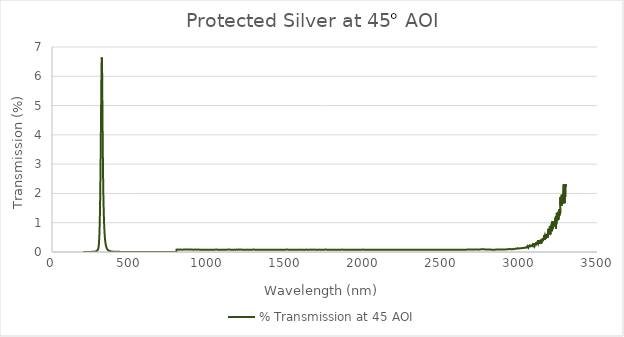
| Category | % Transmission at 45 AOI |
|---|---|
| 200.0 | 0 |
| 201.0 | 0 |
| 202.0 | 0 |
| 203.0 | 0 |
| 204.0 | 0 |
| 205.0 | 0 |
| 206.0 | 0 |
| 207.0 | 0.001 |
| 208.0 | 0 |
| 209.0 | 0 |
| 210.0 | 0.001 |
| 211.0 | 0 |
| 212.0 | 0.001 |
| 213.0 | 0.001 |
| 214.0 | 0.001 |
| 215.0 | 0.001 |
| 216.0 | 0.001 |
| 217.0 | 0.001 |
| 218.0 | 0.001 |
| 219.0 | 0.001 |
| 220.0 | 0.001 |
| 221.0 | 0.001 |
| 222.0 | 0.001 |
| 223.0 | 0.001 |
| 224.0 | 0.001 |
| 225.0 | 0.001 |
| 226.0 | 0.001 |
| 227.0 | 0.001 |
| 228.0 | 0.002 |
| 229.0 | 0.001 |
| 230.0 | 0.002 |
| 231.0 | 0.002 |
| 232.0 | 0.002 |
| 233.0 | 0.002 |
| 234.0 | 0.002 |
| 235.0 | 0.002 |
| 236.0 | 0.002 |
| 237.0 | 0.002 |
| 238.0 | 0.002 |
| 239.0 | 0.002 |
| 240.0 | 0.003 |
| 241.0 | 0.003 |
| 242.0 | 0.003 |
| 243.0 | 0.003 |
| 244.0 | 0.003 |
| 245.0 | 0.003 |
| 246.0 | 0.003 |
| 247.0 | 0.003 |
| 248.0 | 0.003 |
| 249.0 | 0.003 |
| 250.0 | 0.004 |
| 251.0 | 0.004 |
| 252.0 | 0.004 |
| 253.0 | 0.004 |
| 254.0 | 0.004 |
| 255.0 | 0.004 |
| 256.0 | 0.005 |
| 257.0 | 0.005 |
| 258.0 | 0.005 |
| 259.0 | 0.005 |
| 260.0 | 0.006 |
| 261.0 | 0.006 |
| 262.0 | 0.006 |
| 263.0 | 0.007 |
| 264.0 | 0.007 |
| 265.0 | 0.007 |
| 266.0 | 0.008 |
| 267.0 | 0.008 |
| 268.0 | 0.008 |
| 269.0 | 0.009 |
| 270.0 | 0.009 |
| 271.0 | 0.01 |
| 272.0 | 0.011 |
| 273.0 | 0.011 |
| 274.0 | 0.012 |
| 275.0 | 0.013 |
| 276.0 | 0.014 |
| 277.0 | 0.015 |
| 278.0 | 0.016 |
| 279.0 | 0.017 |
| 280.0 | 0.019 |
| 281.0 | 0.02 |
| 282.0 | 0.022 |
| 283.0 | 0.024 |
| 284.0 | 0.026 |
| 285.0 | 0.028 |
| 286.0 | 0.031 |
| 287.0 | 0.034 |
| 288.0 | 0.038 |
| 289.0 | 0.041 |
| 290.0 | 0.046 |
| 291.0 | 0.051 |
| 292.0 | 0.057 |
| 293.0 | 0.064 |
| 294.0 | 0.074 |
| 295.0 | 0.085 |
| 296.0 | 0.098 |
| 297.0 | 0.117 |
| 298.0 | 0.139 |
| 299.0 | 0.17 |
| 300.0 | 0.211 |
| 301.0 | 0.264 |
| 302.0 | 0.332 |
| 303.0 | 0.423 |
| 304.0 | 0.541 |
| 305.0 | 0.686 |
| 306.0 | 0.874 |
| 307.0 | 1.105 |
| 308.0 | 1.382 |
| 309.0 | 1.716 |
| 310.0 | 2.102 |
| 311.0 | 2.542 |
| 312.0 | 3.032 |
| 313.0 | 3.569 |
| 314.0 | 4.131 |
| 315.0 | 4.726 |
| 316.0 | 5.3 |
| 317.0 | 5.831 |
| 318.0 | 6.268 |
| 319.0 | 6.552 |
| 320.0 | 6.642 |
| 321.0 | 6.487 |
| 322.0 | 6.093 |
| 323.0 | 5.522 |
| 324.0 | 4.859 |
| 325.0 | 4.197 |
| 326.0 | 3.598 |
| 327.0 | 3.084 |
| 328.0 | 2.637 |
| 329.0 | 2.252 |
| 330.0 | 1.925 |
| 331.0 | 1.652 |
| 332.0 | 1.424 |
| 333.0 | 1.232 |
| 334.0 | 1.065 |
| 335.0 | 0.927 |
| 336.0 | 0.806 |
| 337.0 | 0.703 |
| 338.0 | 0.615 |
| 339.0 | 0.538 |
| 340.0 | 0.473 |
| 341.0 | 0.414 |
| 342.0 | 0.367 |
| 343.0 | 0.325 |
| 344.0 | 0.29 |
| 345.0 | 0.258 |
| 346.0 | 0.23 |
| 347.0 | 0.207 |
| 348.0 | 0.186 |
| 349.0 | 0.164 |
| 350.0 | 0.15 |
| 351.0 | 0.137 |
| 352.0 | 0.124 |
| 353.0 | 0.112 |
| 354.0 | 0.102 |
| 355.0 | 0.094 |
| 356.0 | 0.086 |
| 357.0 | 0.08 |
| 358.0 | 0.073 |
| 359.0 | 0.068 |
| 360.0 | 0.062 |
| 361.0 | 0.058 |
| 362.0 | 0.054 |
| 363.0 | 0.05 |
| 364.0 | 0.047 |
| 365.0 | 0.044 |
| 366.0 | 0.041 |
| 367.0 | 0.038 |
| 368.0 | 0.036 |
| 369.0 | 0.034 |
| 370.0 | 0.032 |
| 371.0 | 0.03 |
| 372.0 | 0.029 |
| 373.0 | 0.027 |
| 374.0 | 0.025 |
| 375.0 | 0.024 |
| 376.0 | 0.023 |
| 377.0 | 0.022 |
| 378.0 | 0.021 |
| 379.0 | 0.02 |
| 380.0 | 0.019 |
| 381.0 | 0.018 |
| 382.0 | 0.017 |
| 383.0 | 0.016 |
| 384.0 | 0.016 |
| 385.0 | 0.015 |
| 386.0 | 0.015 |
| 387.0 | 0.014 |
| 388.0 | 0.014 |
| 389.0 | 0.013 |
| 390.0 | 0.012 |
| 391.0 | 0.012 |
| 392.0 | 0.012 |
| 393.0 | 0.012 |
| 394.0 | 0.011 |
| 395.0 | 0.011 |
| 396.0 | 0.01 |
| 397.0 | 0.01 |
| 398.0 | 0.01 |
| 399.0 | 0.01 |
| 400.0 | 0.009 |
| 401.0 | 0.009 |
| 402.0 | 0.008 |
| 403.0 | 0.008 |
| 404.0 | 0.008 |
| 405.0 | 0.008 |
| 406.0 | 0.008 |
| 407.0 | 0.007 |
| 408.0 | 0.007 |
| 409.0 | 0.007 |
| 410.0 | 0.007 |
| 411.0 | 0.007 |
| 412.0 | 0.007 |
| 413.0 | 0.007 |
| 414.0 | 0.007 |
| 415.0 | 0.006 |
| 416.0 | 0.006 |
| 417.0 | 0.006 |
| 418.0 | 0.006 |
| 419.0 | 0.006 |
| 420.0 | 0.006 |
| 421.0 | 0.006 |
| 422.0 | 0.005 |
| 423.0 | 0.005 |
| 424.0 | 0.005 |
| 425.0 | 0.005 |
| 426.0 | 0.005 |
| 427.0 | 0.005 |
| 428.0 | 0.005 |
| 429.0 | 0.005 |
| 430.0 | 0.005 |
| 431.0 | 0.005 |
| 432.0 | 0.004 |
| 433.0 | 0.004 |
| 434.0 | 0.004 |
| 435.0 | 0.004 |
| 436.0 | 0.004 |
| 437.0 | 0.004 |
| 438.0 | 0.004 |
| 439.0 | 0.004 |
| 440.0 | 0.004 |
| 441.0 | 0.004 |
| 442.0 | 0.004 |
| 443.0 | 0.004 |
| 444.0 | 0.004 |
| 445.0 | 0.004 |
| 446.0 | 0.003 |
| 447.0 | 0.004 |
| 448.0 | 0.004 |
| 449.0 | 0.003 |
| 450.0 | 0.003 |
| 451.0 | 0.004 |
| 452.0 | 0.003 |
| 453.0 | 0.003 |
| 454.0 | 0.003 |
| 455.0 | 0.003 |
| 456.0 | 0.003 |
| 457.0 | 0.003 |
| 458.0 | 0.003 |
| 459.0 | 0.003 |
| 460.0 | 0.003 |
| 461.0 | 0.003 |
| 462.0 | 0.003 |
| 463.0 | 0.003 |
| 464.0 | 0.003 |
| 465.0 | 0.003 |
| 466.0 | 0.003 |
| 467.0 | 0.003 |
| 468.0 | 0.003 |
| 469.0 | 0.003 |
| 470.0 | 0.003 |
| 471.0 | 0.003 |
| 472.0 | 0.003 |
| 473.0 | 0.003 |
| 474.0 | 0.002 |
| 475.0 | 0.003 |
| 476.0 | 0.003 |
| 477.0 | 0.003 |
| 478.0 | 0.002 |
| 479.0 | 0.002 |
| 480.0 | 0.002 |
| 481.0 | 0.002 |
| 482.0 | 0.002 |
| 483.0 | 0.002 |
| 484.0 | 0.002 |
| 485.0 | 0.002 |
| 486.0 | 0.002 |
| 487.0 | 0.002 |
| 488.0 | 0.002 |
| 489.0 | 0.002 |
| 490.0 | 0.002 |
| 491.0 | 0.002 |
| 492.0 | 0.002 |
| 493.0 | 0.002 |
| 494.0 | 0.002 |
| 495.0 | 0.002 |
| 496.0 | 0.002 |
| 497.0 | 0.002 |
| 498.0 | 0.002 |
| 499.0 | 0.002 |
| 500.0 | 0.002 |
| 501.0 | 0.002 |
| 502.0 | 0.002 |
| 503.0 | 0.002 |
| 504.0 | 0.002 |
| 505.0 | 0.002 |
| 506.0 | 0.002 |
| 507.0 | 0.002 |
| 508.0 | 0.002 |
| 509.0 | 0.002 |
| 510.0 | 0.002 |
| 511.0 | 0.002 |
| 512.0 | 0.002 |
| 513.0 | 0.002 |
| 514.0 | 0.002 |
| 515.0 | 0.002 |
| 516.0 | 0.002 |
| 517.0 | 0.002 |
| 518.0 | 0.002 |
| 519.0 | 0.002 |
| 520.0 | 0.002 |
| 521.0 | 0.002 |
| 522.0 | 0.002 |
| 523.0 | 0.002 |
| 524.0 | 0.002 |
| 525.0 | 0.002 |
| 526.0 | 0.002 |
| 527.0 | 0.002 |
| 528.0 | 0.002 |
| 529.0 | 0.002 |
| 530.0 | 0.002 |
| 531.0 | 0.002 |
| 532.0 | 0.002 |
| 533.0 | 0.002 |
| 534.0 | 0.002 |
| 535.0 | 0.002 |
| 536.0 | 0.002 |
| 537.0 | 0.002 |
| 538.0 | 0.002 |
| 539.0 | 0.002 |
| 540.0 | 0.002 |
| 541.0 | 0.001 |
| 542.0 | 0.002 |
| 543.0 | 0.002 |
| 544.0 | 0.001 |
| 545.0 | 0.002 |
| 546.0 | 0.002 |
| 547.0 | 0.002 |
| 548.0 | 0.002 |
| 549.0 | 0.002 |
| 550.0 | 0.001 |
| 551.0 | 0.001 |
| 552.0 | 0.002 |
| 553.0 | 0.002 |
| 554.0 | 0.001 |
| 555.0 | 0.001 |
| 556.0 | 0.002 |
| 557.0 | 0.002 |
| 558.0 | 0.001 |
| 559.0 | 0.001 |
| 560.0 | 0.001 |
| 561.0 | 0.002 |
| 562.0 | 0.001 |
| 563.0 | 0.001 |
| 564.0 | 0.001 |
| 565.0 | 0.001 |
| 566.0 | 0.001 |
| 567.0 | 0.001 |
| 568.0 | 0.001 |
| 569.0 | 0.001 |
| 570.0 | 0.002 |
| 571.0 | 0.001 |
| 572.0 | 0.001 |
| 573.0 | 0.001 |
| 574.0 | 0.001 |
| 575.0 | 0.001 |
| 576.0 | 0.001 |
| 577.0 | 0.001 |
| 578.0 | 0.001 |
| 579.0 | 0.001 |
| 580.0 | 0.001 |
| 581.0 | 0.001 |
| 582.0 | 0.001 |
| 583.0 | 0.001 |
| 584.0 | 0.001 |
| 585.0 | 0.001 |
| 586.0 | 0.001 |
| 587.0 | 0.001 |
| 588.0 | 0.001 |
| 589.0 | 0.001 |
| 590.0 | 0.001 |
| 591.0 | 0.001 |
| 592.0 | 0.001 |
| 593.0 | 0.001 |
| 594.0 | 0.001 |
| 595.0 | 0.001 |
| 596.0 | 0.001 |
| 597.0 | 0.001 |
| 598.0 | 0.001 |
| 599.0 | 0.001 |
| 600.0 | 0.001 |
| 601.0 | 0.001 |
| 602.0 | 0.001 |
| 603.0 | 0.001 |
| 604.0 | 0.001 |
| 605.0 | 0.001 |
| 606.0 | 0.001 |
| 607.0 | 0.001 |
| 608.0 | 0.001 |
| 609.0 | 0.001 |
| 610.0 | 0.001 |
| 611.0 | 0.001 |
| 612.0 | 0.001 |
| 613.0 | 0.001 |
| 614.0 | 0.001 |
| 615.0 | 0.001 |
| 616.0 | 0.001 |
| 617.0 | 0.001 |
| 618.0 | 0.001 |
| 619.0 | 0.001 |
| 620.0 | 0.001 |
| 621.0 | 0.001 |
| 622.0 | 0.001 |
| 623.0 | 0.001 |
| 624.0 | 0.001 |
| 625.0 | 0.001 |
| 626.0 | 0.001 |
| 627.0 | 0.001 |
| 628.0 | 0.001 |
| 629.0 | 0.001 |
| 630.0 | 0.001 |
| 631.0 | 0.001 |
| 632.0 | 0.001 |
| 633.0 | 0.001 |
| 634.0 | 0.001 |
| 635.0 | 0.001 |
| 636.0 | 0.001 |
| 637.0 | 0.001 |
| 638.0 | 0.001 |
| 639.0 | 0.001 |
| 640.0 | 0.001 |
| 641.0 | 0.001 |
| 642.0 | 0.001 |
| 643.0 | 0.001 |
| 644.0 | 0.001 |
| 645.0 | 0.001 |
| 646.0 | 0.001 |
| 647.0 | 0.001 |
| 648.0 | 0.001 |
| 649.0 | 0.001 |
| 650.0 | 0.001 |
| 651.0 | 0.001 |
| 652.0 | 0.001 |
| 653.0 | 0.001 |
| 654.0 | 0.001 |
| 655.0 | 0.001 |
| 656.0 | 0.001 |
| 657.0 | 0.001 |
| 658.0 | 0.001 |
| 659.0 | 0.001 |
| 660.0 | 0.001 |
| 661.0 | 0.001 |
| 662.0 | 0.001 |
| 663.0 | 0.001 |
| 664.0 | 0.001 |
| 665.0 | 0.001 |
| 666.0 | 0.001 |
| 667.0 | 0.001 |
| 668.0 | 0.001 |
| 669.0 | 0.001 |
| 670.0 | 0.001 |
| 671.0 | 0.001 |
| 672.0 | 0.001 |
| 673.0 | 0.001 |
| 674.0 | 0.001 |
| 675.0 | 0.001 |
| 676.0 | 0.001 |
| 677.0 | 0.001 |
| 678.0 | 0.001 |
| 679.0 | 0.001 |
| 680.0 | 0.001 |
| 681.0 | 0.001 |
| 682.0 | 0.001 |
| 683.0 | 0.001 |
| 684.0 | 0.001 |
| 685.0 | 0.001 |
| 686.0 | 0.001 |
| 687.0 | 0.001 |
| 688.0 | 0.001 |
| 689.0 | 0.001 |
| 690.0 | 0.001 |
| 691.0 | 0.001 |
| 692.0 | 0.001 |
| 693.0 | 0.001 |
| 694.0 | 0.001 |
| 695.0 | 0.001 |
| 696.0 | 0.001 |
| 697.0 | 0.001 |
| 698.0 | 0.001 |
| 699.0 | 0.001 |
| 700.0 | 0.001 |
| 701.0 | 0.001 |
| 702.0 | 0.001 |
| 703.0 | 0.001 |
| 704.0 | 0.001 |
| 705.0 | 0.001 |
| 706.0 | 0.001 |
| 707.0 | 0.001 |
| 708.0 | 0.001 |
| 709.0 | 0.001 |
| 710.0 | 0.001 |
| 711.0 | 0.001 |
| 712.0 | 0.001 |
| 713.0 | 0.001 |
| 714.0 | 0.001 |
| 715.0 | 0.001 |
| 716.0 | 0.001 |
| 717.0 | 0.001 |
| 718.0 | 0.001 |
| 719.0 | 0.001 |
| 720.0 | 0.001 |
| 721.0 | 0.001 |
| 722.0 | 0.001 |
| 723.0 | 0.001 |
| 724.0 | 0.001 |
| 725.0 | 0.001 |
| 726.0 | 0.001 |
| 727.0 | 0.001 |
| 728.0 | 0.001 |
| 729.0 | 0.001 |
| 730.0 | 0.001 |
| 731.0 | 0.001 |
| 732.0 | 0.001 |
| 733.0 | 0.001 |
| 734.0 | 0.001 |
| 735.0 | 0.001 |
| 736.0 | 0.001 |
| 737.0 | 0.001 |
| 738.0 | 0.001 |
| 739.0 | 0.001 |
| 740.0 | 0.001 |
| 741.0 | 0.001 |
| 742.0 | 0.001 |
| 743.0 | 0.001 |
| 744.0 | 0.001 |
| 745.0 | 0.001 |
| 746.0 | 0.001 |
| 747.0 | 0.001 |
| 748.0 | 0.001 |
| 749.0 | 0.001 |
| 750.0 | 0.001 |
| 751.0 | 0.001 |
| 752.0 | 0.001 |
| 753.0 | 0.001 |
| 754.0 | 0.001 |
| 755.0 | 0.001 |
| 756.0 | 0.001 |
| 757.0 | 0.001 |
| 758.0 | 0.001 |
| 759.0 | 0.001 |
| 760.0 | 0.001 |
| 761.0 | 0.001 |
| 762.0 | 0.001 |
| 763.0 | 0.001 |
| 764.0 | 0.001 |
| 765.0 | 0.001 |
| 766.0 | 0.001 |
| 767.0 | 0.001 |
| 768.0 | 0.001 |
| 769.0 | 0.001 |
| 770.0 | 0.001 |
| 771.0 | 0.001 |
| 772.0 | 0.001 |
| 773.0 | 0.001 |
| 774.0 | 0.001 |
| 775.0 | 0.001 |
| 776.0 | 0.001 |
| 777.0 | 0.001 |
| 778.0 | 0.001 |
| 779.0 | 0.001 |
| 780.0 | 0.001 |
| 781.0 | 0.001 |
| 782.0 | 0.001 |
| 783.0 | 0.001 |
| 784.0 | 0.001 |
| 785.0 | 0.001 |
| 786.0 | 0.001 |
| 787.0 | 0.001 |
| 788.0 | 0.001 |
| 789.0 | 0.001 |
| 790.0 | 0.001 |
| 791.0 | 0.001 |
| 792.0 | 0.001 |
| 793.0 | 0.001 |
| 794.0 | 0.001 |
| 795.0 | 0.001 |
| 796.0 | 0.001 |
| 797.0 | 0.001 |
| 798.0 | 0.001 |
| 799.0 | 0 |
| 800.0 | 0.081 |
| 801.0 | 0.084 |
| 802.0 | 0.083 |
| 803.0 | 0.081 |
| 804.0 | 0.081 |
| 805.0 | 0.086 |
| 806.0 | 0.082 |
| 807.0 | 0.085 |
| 808.0 | 0.081 |
| 809.0 | 0.084 |
| 810.0 | 0.083 |
| 811.0 | 0.083 |
| 812.0 | 0.082 |
| 813.0 | 0.084 |
| 814.0 | 0.08 |
| 815.0 | 0.084 |
| 816.0 | 0.082 |
| 817.0 | 0.081 |
| 818.0 | 0.084 |
| 819.0 | 0.082 |
| 820.0 | 0.082 |
| 821.0 | 0.082 |
| 822.0 | 0.084 |
| 823.0 | 0.082 |
| 824.0 | 0.082 |
| 825.0 | 0.084 |
| 826.0 | 0.083 |
| 827.0 | 0.083 |
| 828.0 | 0.081 |
| 829.0 | 0.085 |
| 830.0 | 0.083 |
| 831.0 | 0.082 |
| 832.0 | 0.084 |
| 833.0 | 0.083 |
| 834.0 | 0.084 |
| 835.0 | 0.08 |
| 836.0 | 0.079 |
| 837.0 | 0.083 |
| 838.0 | 0.08 |
| 839.0 | 0.085 |
| 840.0 | 0.084 |
| 841.0 | 0.082 |
| 842.0 | 0.081 |
| 843.0 | 0.085 |
| 844.0 | 0.086 |
| 845.0 | 0.082 |
| 846.0 | 0.084 |
| 847.0 | 0.085 |
| 848.0 | 0.084 |
| 849.0 | 0.086 |
| 850.0 | 0.08 |
| 851.0 | 0.082 |
| 852.0 | 0.083 |
| 853.0 | 0.084 |
| 854.0 | 0.085 |
| 855.0 | 0.08 |
| 856.0 | 0.083 |
| 857.0 | 0.083 |
| 858.0 | 0.083 |
| 859.0 | 0.086 |
| 860.0 | 0.086 |
| 861.0 | 0.084 |
| 862.0 | 0.083 |
| 863.0 | 0.085 |
| 864.0 | 0.082 |
| 865.0 | 0.082 |
| 866.0 | 0.082 |
| 867.0 | 0.085 |
| 868.0 | 0.082 |
| 869.0 | 0.081 |
| 870.0 | 0.082 |
| 871.0 | 0.082 |
| 872.0 | 0.081 |
| 873.0 | 0.085 |
| 874.0 | 0.083 |
| 875.0 | 0.082 |
| 876.0 | 0.083 |
| 877.0 | 0.082 |
| 878.0 | 0.082 |
| 879.0 | 0.082 |
| 880.0 | 0.083 |
| 881.0 | 0.082 |
| 882.0 | 0.083 |
| 883.0 | 0.082 |
| 884.0 | 0.08 |
| 885.0 | 0.086 |
| 886.0 | 0.082 |
| 887.0 | 0.082 |
| 888.0 | 0.082 |
| 889.0 | 0.081 |
| 890.0 | 0.08 |
| 891.0 | 0.083 |
| 892.0 | 0.085 |
| 893.0 | 0.082 |
| 894.0 | 0.084 |
| 895.0 | 0.082 |
| 896.0 | 0.083 |
| 897.0 | 0.082 |
| 898.0 | 0.083 |
| 899.0 | 0.081 |
| 900.0 | 0.083 |
| 901.0 | 0.083 |
| 902.0 | 0.081 |
| 903.0 | 0.081 |
| 904.0 | 0.081 |
| 905.0 | 0.081 |
| 906.0 | 0.081 |
| 907.0 | 0.083 |
| 908.0 | 0.081 |
| 909.0 | 0.082 |
| 910.0 | 0.083 |
| 911.0 | 0.08 |
| 912.0 | 0.08 |
| 913.0 | 0.083 |
| 914.0 | 0.081 |
| 915.0 | 0.081 |
| 916.0 | 0.081 |
| 917.0 | 0.08 |
| 918.0 | 0.083 |
| 919.0 | 0.082 |
| 920.0 | 0.08 |
| 921.0 | 0.08 |
| 922.0 | 0.084 |
| 923.0 | 0.081 |
| 924.0 | 0.082 |
| 925.0 | 0.082 |
| 926.0 | 0.081 |
| 927.0 | 0.079 |
| 928.0 | 0.078 |
| 929.0 | 0.08 |
| 930.0 | 0.081 |
| 931.0 | 0.081 |
| 932.0 | 0.082 |
| 933.0 | 0.08 |
| 934.0 | 0.08 |
| 935.0 | 0.081 |
| 936.0 | 0.08 |
| 937.0 | 0.082 |
| 938.0 | 0.081 |
| 939.0 | 0.081 |
| 940.0 | 0.084 |
| 941.0 | 0.08 |
| 942.0 | 0.08 |
| 943.0 | 0.078 |
| 944.0 | 0.08 |
| 945.0 | 0.081 |
| 946.0 | 0.081 |
| 947.0 | 0.081 |
| 948.0 | 0.079 |
| 949.0 | 0.08 |
| 950.0 | 0.082 |
| 951.0 | 0.08 |
| 952.0 | 0.083 |
| 953.0 | 0.081 |
| 954.0 | 0.081 |
| 955.0 | 0.083 |
| 956.0 | 0.08 |
| 957.0 | 0.081 |
| 958.0 | 0.082 |
| 959.0 | 0.082 |
| 960.0 | 0.08 |
| 961.0 | 0.081 |
| 962.0 | 0.079 |
| 963.0 | 0.082 |
| 964.0 | 0.081 |
| 965.0 | 0.08 |
| 966.0 | 0.079 |
| 967.0 | 0.08 |
| 968.0 | 0.08 |
| 969.0 | 0.082 |
| 970.0 | 0.081 |
| 971.0 | 0.083 |
| 972.0 | 0.081 |
| 973.0 | 0.08 |
| 974.0 | 0.08 |
| 975.0 | 0.08 |
| 976.0 | 0.083 |
| 977.0 | 0.084 |
| 978.0 | 0.081 |
| 979.0 | 0.079 |
| 980.0 | 0.078 |
| 981.0 | 0.081 |
| 982.0 | 0.081 |
| 983.0 | 0.079 |
| 984.0 | 0.083 |
| 985.0 | 0.081 |
| 986.0 | 0.081 |
| 987.0 | 0.079 |
| 988.0 | 0.081 |
| 989.0 | 0.079 |
| 990.0 | 0.083 |
| 991.0 | 0.08 |
| 992.0 | 0.081 |
| 993.0 | 0.081 |
| 994.0 | 0.083 |
| 995.0 | 0.08 |
| 996.0 | 0.081 |
| 997.0 | 0.081 |
| 998.0 | 0.08 |
| 999.0 | 0.082 |
| 1000.0 | 0.081 |
| 1001.0 | 0.081 |
| 1002.0 | 0.082 |
| 1003.0 | 0.079 |
| 1004.0 | 0.077 |
| 1005.0 | 0.08 |
| 1006.0 | 0.083 |
| 1007.0 | 0.079 |
| 1008.0 | 0.08 |
| 1009.0 | 0.078 |
| 1010.0 | 0.08 |
| 1011.0 | 0.08 |
| 1012.0 | 0.078 |
| 1013.0 | 0.079 |
| 1014.0 | 0.08 |
| 1015.0 | 0.081 |
| 1016.0 | 0.081 |
| 1017.0 | 0.081 |
| 1018.0 | 0.082 |
| 1019.0 | 0.078 |
| 1020.0 | 0.081 |
| 1021.0 | 0.081 |
| 1022.0 | 0.08 |
| 1023.0 | 0.082 |
| 1024.0 | 0.08 |
| 1025.0 | 0.081 |
| 1026.0 | 0.078 |
| 1027.0 | 0.079 |
| 1028.0 | 0.081 |
| 1029.0 | 0.082 |
| 1030.0 | 0.082 |
| 1031.0 | 0.08 |
| 1032.0 | 0.081 |
| 1033.0 | 0.081 |
| 1034.0 | 0.081 |
| 1035.0 | 0.081 |
| 1036.0 | 0.084 |
| 1037.0 | 0.081 |
| 1038.0 | 0.08 |
| 1039.0 | 0.079 |
| 1040.0 | 0.08 |
| 1041.0 | 0.081 |
| 1042.0 | 0.08 |
| 1043.0 | 0.082 |
| 1044.0 | 0.082 |
| 1045.0 | 0.079 |
| 1046.0 | 0.081 |
| 1047.0 | 0.081 |
| 1048.0 | 0.082 |
| 1049.0 | 0.082 |
| 1050.0 | 0.081 |
| 1051.0 | 0.081 |
| 1052.0 | 0.083 |
| 1053.0 | 0.079 |
| 1054.0 | 0.081 |
| 1055.0 | 0.081 |
| 1056.0 | 0.081 |
| 1057.0 | 0.079 |
| 1058.0 | 0.08 |
| 1059.0 | 0.081 |
| 1060.0 | 0.08 |
| 1061.0 | 0.08 |
| 1062.0 | 0.081 |
| 1063.0 | 0.082 |
| 1064.0 | 0.083 |
| 1065.0 | 0.081 |
| 1066.0 | 0.078 |
| 1067.0 | 0.08 |
| 1068.0 | 0.081 |
| 1069.0 | 0.082 |
| 1070.0 | 0.08 |
| 1071.0 | 0.082 |
| 1072.0 | 0.08 |
| 1073.0 | 0.079 |
| 1074.0 | 0.081 |
| 1075.0 | 0.08 |
| 1076.0 | 0.082 |
| 1077.0 | 0.082 |
| 1078.0 | 0.078 |
| 1079.0 | 0.078 |
| 1080.0 | 0.081 |
| 1081.0 | 0.081 |
| 1082.0 | 0.08 |
| 1083.0 | 0.081 |
| 1084.0 | 0.08 |
| 1085.0 | 0.078 |
| 1086.0 | 0.081 |
| 1087.0 | 0.081 |
| 1088.0 | 0.079 |
| 1089.0 | 0.08 |
| 1090.0 | 0.08 |
| 1091.0 | 0.082 |
| 1092.0 | 0.078 |
| 1093.0 | 0.08 |
| 1094.0 | 0.078 |
| 1095.0 | 0.079 |
| 1096.0 | 0.078 |
| 1097.0 | 0.08 |
| 1098.0 | 0.083 |
| 1099.0 | 0.081 |
| 1100.0 | 0.077 |
| 1101.0 | 0.078 |
| 1102.0 | 0.079 |
| 1103.0 | 0.079 |
| 1104.0 | 0.078 |
| 1105.0 | 0.08 |
| 1106.0 | 0.078 |
| 1107.0 | 0.082 |
| 1108.0 | 0.08 |
| 1109.0 | 0.079 |
| 1110.0 | 0.079 |
| 1111.0 | 0.082 |
| 1112.0 | 0.08 |
| 1113.0 | 0.079 |
| 1114.0 | 0.083 |
| 1115.0 | 0.08 |
| 1116.0 | 0.078 |
| 1117.0 | 0.08 |
| 1118.0 | 0.081 |
| 1119.0 | 0.08 |
| 1120.0 | 0.082 |
| 1121.0 | 0.082 |
| 1122.0 | 0.077 |
| 1123.0 | 0.08 |
| 1124.0 | 0.081 |
| 1125.0 | 0.079 |
| 1126.0 | 0.081 |
| 1127.0 | 0.08 |
| 1128.0 | 0.079 |
| 1129.0 | 0.085 |
| 1130.0 | 0.08 |
| 1131.0 | 0.08 |
| 1132.0 | 0.083 |
| 1133.0 | 0.082 |
| 1134.0 | 0.079 |
| 1135.0 | 0.078 |
| 1136.0 | 0.083 |
| 1137.0 | 0.078 |
| 1138.0 | 0.081 |
| 1139.0 | 0.079 |
| 1140.0 | 0.08 |
| 1141.0 | 0.077 |
| 1142.0 | 0.08 |
| 1143.0 | 0.081 |
| 1144.0 | 0.081 |
| 1145.0 | 0.081 |
| 1146.0 | 0.078 |
| 1147.0 | 0.077 |
| 1148.0 | 0.08 |
| 1149.0 | 0.081 |
| 1150.0 | 0.079 |
| 1151.0 | 0.081 |
| 1152.0 | 0.08 |
| 1153.0 | 0.079 |
| 1154.0 | 0.079 |
| 1155.0 | 0.079 |
| 1156.0 | 0.083 |
| 1157.0 | 0.08 |
| 1158.0 | 0.079 |
| 1159.0 | 0.079 |
| 1160.0 | 0.078 |
| 1161.0 | 0.081 |
| 1162.0 | 0.08 |
| 1163.0 | 0.08 |
| 1164.0 | 0.08 |
| 1165.0 | 0.081 |
| 1166.0 | 0.08 |
| 1167.0 | 0.081 |
| 1168.0 | 0.078 |
| 1169.0 | 0.081 |
| 1170.0 | 0.078 |
| 1171.0 | 0.08 |
| 1172.0 | 0.079 |
| 1173.0 | 0.081 |
| 1174.0 | 0.08 |
| 1175.0 | 0.077 |
| 1176.0 | 0.08 |
| 1177.0 | 0.08 |
| 1178.0 | 0.08 |
| 1179.0 | 0.08 |
| 1180.0 | 0.079 |
| 1181.0 | 0.082 |
| 1182.0 | 0.083 |
| 1183.0 | 0.081 |
| 1184.0 | 0.078 |
| 1185.0 | 0.082 |
| 1186.0 | 0.08 |
| 1187.0 | 0.08 |
| 1188.0 | 0.081 |
| 1189.0 | 0.079 |
| 1190.0 | 0.08 |
| 1191.0 | 0.08 |
| 1192.0 | 0.078 |
| 1193.0 | 0.082 |
| 1194.0 | 0.082 |
| 1195.0 | 0.08 |
| 1196.0 | 0.08 |
| 1197.0 | 0.08 |
| 1198.0 | 0.084 |
| 1199.0 | 0.085 |
| 1200.0 | 0.081 |
| 1201.0 | 0.079 |
| 1202.0 | 0.08 |
| 1203.0 | 0.081 |
| 1204.0 | 0.081 |
| 1205.0 | 0.08 |
| 1206.0 | 0.081 |
| 1207.0 | 0.081 |
| 1208.0 | 0.08 |
| 1209.0 | 0.08 |
| 1210.0 | 0.082 |
| 1211.0 | 0.076 |
| 1212.0 | 0.081 |
| 1213.0 | 0.081 |
| 1214.0 | 0.082 |
| 1215.0 | 0.08 |
| 1216.0 | 0.078 |
| 1217.0 | 0.079 |
| 1218.0 | 0.081 |
| 1219.0 | 0.079 |
| 1220.0 | 0.081 |
| 1221.0 | 0.08 |
| 1222.0 | 0.077 |
| 1223.0 | 0.08 |
| 1224.0 | 0.08 |
| 1225.0 | 0.079 |
| 1226.0 | 0.08 |
| 1227.0 | 0.08 |
| 1228.0 | 0.081 |
| 1229.0 | 0.081 |
| 1230.0 | 0.079 |
| 1231.0 | 0.081 |
| 1232.0 | 0.077 |
| 1233.0 | 0.079 |
| 1234.0 | 0.081 |
| 1235.0 | 0.08 |
| 1236.0 | 0.079 |
| 1237.0 | 0.08 |
| 1238.0 | 0.079 |
| 1239.0 | 0.077 |
| 1240.0 | 0.081 |
| 1241.0 | 0.08 |
| 1242.0 | 0.077 |
| 1243.0 | 0.082 |
| 1244.0 | 0.079 |
| 1245.0 | 0.082 |
| 1246.0 | 0.08 |
| 1247.0 | 0.081 |
| 1248.0 | 0.081 |
| 1249.0 | 0.078 |
| 1250.0 | 0.08 |
| 1251.0 | 0.08 |
| 1252.0 | 0.08 |
| 1253.0 | 0.082 |
| 1254.0 | 0.078 |
| 1255.0 | 0.079 |
| 1256.0 | 0.081 |
| 1257.0 | 0.079 |
| 1258.0 | 0.08 |
| 1259.0 | 0.079 |
| 1260.0 | 0.081 |
| 1261.0 | 0.079 |
| 1262.0 | 0.078 |
| 1263.0 | 0.079 |
| 1264.0 | 0.08 |
| 1265.0 | 0.081 |
| 1266.0 | 0.08 |
| 1267.0 | 0.081 |
| 1268.0 | 0.079 |
| 1269.0 | 0.08 |
| 1270.0 | 0.08 |
| 1271.0 | 0.08 |
| 1272.0 | 0.081 |
| 1273.0 | 0.081 |
| 1274.0 | 0.08 |
| 1275.0 | 0.08 |
| 1276.0 | 0.08 |
| 1277.0 | 0.078 |
| 1278.0 | 0.081 |
| 1279.0 | 0.079 |
| 1280.0 | 0.081 |
| 1281.0 | 0.081 |
| 1282.0 | 0.08 |
| 1283.0 | 0.079 |
| 1284.0 | 0.082 |
| 1285.0 | 0.081 |
| 1286.0 | 0.079 |
| 1287.0 | 0.08 |
| 1288.0 | 0.079 |
| 1289.0 | 0.081 |
| 1290.0 | 0.081 |
| 1291.0 | 0.078 |
| 1292.0 | 0.08 |
| 1293.0 | 0.078 |
| 1294.0 | 0.08 |
| 1295.0 | 0.084 |
| 1296.0 | 0.08 |
| 1297.0 | 0.082 |
| 1298.0 | 0.081 |
| 1299.0 | 0.082 |
| 1300.0 | 0.078 |
| 1301.0 | 0.081 |
| 1302.0 | 0.079 |
| 1303.0 | 0.078 |
| 1304.0 | 0.081 |
| 1305.0 | 0.081 |
| 1306.0 | 0.078 |
| 1307.0 | 0.078 |
| 1308.0 | 0.081 |
| 1309.0 | 0.08 |
| 1310.0 | 0.079 |
| 1311.0 | 0.08 |
| 1312.0 | 0.082 |
| 1313.0 | 0.079 |
| 1314.0 | 0.08 |
| 1315.0 | 0.08 |
| 1316.0 | 0.079 |
| 1317.0 | 0.08 |
| 1318.0 | 0.081 |
| 1319.0 | 0.078 |
| 1320.0 | 0.08 |
| 1321.0 | 0.079 |
| 1322.0 | 0.081 |
| 1323.0 | 0.081 |
| 1324.0 | 0.08 |
| 1325.0 | 0.081 |
| 1326.0 | 0.082 |
| 1327.0 | 0.082 |
| 1328.0 | 0.079 |
| 1329.0 | 0.079 |
| 1330.0 | 0.08 |
| 1331.0 | 0.08 |
| 1332.0 | 0.081 |
| 1333.0 | 0.081 |
| 1334.0 | 0.079 |
| 1335.0 | 0.082 |
| 1336.0 | 0.081 |
| 1337.0 | 0.081 |
| 1338.0 | 0.082 |
| 1339.0 | 0.076 |
| 1340.0 | 0.08 |
| 1341.0 | 0.08 |
| 1342.0 | 0.082 |
| 1343.0 | 0.077 |
| 1344.0 | 0.082 |
| 1345.0 | 0.08 |
| 1346.0 | 0.08 |
| 1347.0 | 0.081 |
| 1348.0 | 0.081 |
| 1349.0 | 0.081 |
| 1350.0 | 0.081 |
| 1351.0 | 0.082 |
| 1352.0 | 0.079 |
| 1353.0 | 0.08 |
| 1354.0 | 0.08 |
| 1355.0 | 0.08 |
| 1356.0 | 0.08 |
| 1357.0 | 0.079 |
| 1358.0 | 0.082 |
| 1359.0 | 0.078 |
| 1360.0 | 0.079 |
| 1361.0 | 0.08 |
| 1362.0 | 0.079 |
| 1363.0 | 0.078 |
| 1364.0 | 0.078 |
| 1365.0 | 0.077 |
| 1366.0 | 0.08 |
| 1367.0 | 0.079 |
| 1368.0 | 0.079 |
| 1369.0 | 0.08 |
| 1370.0 | 0.081 |
| 1371.0 | 0.081 |
| 1372.0 | 0.082 |
| 1373.0 | 0.08 |
| 1374.0 | 0.081 |
| 1375.0 | 0.081 |
| 1376.0 | 0.08 |
| 1377.0 | 0.08 |
| 1378.0 | 0.079 |
| 1379.0 | 0.078 |
| 1380.0 | 0.078 |
| 1381.0 | 0.08 |
| 1382.0 | 0.082 |
| 1383.0 | 0.08 |
| 1384.0 | 0.08 |
| 1385.0 | 0.082 |
| 1386.0 | 0.08 |
| 1387.0 | 0.08 |
| 1388.0 | 0.081 |
| 1389.0 | 0.081 |
| 1390.0 | 0.082 |
| 1391.0 | 0.081 |
| 1392.0 | 0.08 |
| 1393.0 | 0.08 |
| 1394.0 | 0.079 |
| 1395.0 | 0.078 |
| 1396.0 | 0.082 |
| 1397.0 | 0.082 |
| 1398.0 | 0.078 |
| 1399.0 | 0.078 |
| 1400.0 | 0.08 |
| 1401.0 | 0.081 |
| 1402.0 | 0.079 |
| 1403.0 | 0.08 |
| 1404.0 | 0.078 |
| 1405.0 | 0.079 |
| 1406.0 | 0.08 |
| 1407.0 | 0.08 |
| 1408.0 | 0.08 |
| 1409.0 | 0.08 |
| 1410.0 | 0.081 |
| 1411.0 | 0.078 |
| 1412.0 | 0.078 |
| 1413.0 | 0.079 |
| 1414.0 | 0.081 |
| 1415.0 | 0.078 |
| 1416.0 | 0.077 |
| 1417.0 | 0.079 |
| 1418.0 | 0.079 |
| 1419.0 | 0.08 |
| 1420.0 | 0.08 |
| 1421.0 | 0.08 |
| 1422.0 | 0.081 |
| 1423.0 | 0.078 |
| 1424.0 | 0.081 |
| 1425.0 | 0.078 |
| 1426.0 | 0.082 |
| 1427.0 | 0.079 |
| 1428.0 | 0.076 |
| 1429.0 | 0.082 |
| 1430.0 | 0.077 |
| 1431.0 | 0.078 |
| 1432.0 | 0.083 |
| 1433.0 | 0.079 |
| 1434.0 | 0.08 |
| 1435.0 | 0.08 |
| 1436.0 | 0.081 |
| 1437.0 | 0.08 |
| 1438.0 | 0.08 |
| 1439.0 | 0.079 |
| 1440.0 | 0.081 |
| 1441.0 | 0.079 |
| 1442.0 | 0.08 |
| 1443.0 | 0.078 |
| 1444.0 | 0.079 |
| 1445.0 | 0.08 |
| 1446.0 | 0.079 |
| 1447.0 | 0.082 |
| 1448.0 | 0.08 |
| 1449.0 | 0.079 |
| 1450.0 | 0.078 |
| 1451.0 | 0.081 |
| 1452.0 | 0.08 |
| 1453.0 | 0.08 |
| 1454.0 | 0.081 |
| 1455.0 | 0.08 |
| 1456.0 | 0.077 |
| 1457.0 | 0.079 |
| 1458.0 | 0.078 |
| 1459.0 | 0.079 |
| 1460.0 | 0.08 |
| 1461.0 | 0.079 |
| 1462.0 | 0.081 |
| 1463.0 | 0.079 |
| 1464.0 | 0.079 |
| 1465.0 | 0.08 |
| 1466.0 | 0.081 |
| 1467.0 | 0.079 |
| 1468.0 | 0.08 |
| 1469.0 | 0.078 |
| 1470.0 | 0.08 |
| 1471.0 | 0.078 |
| 1472.0 | 0.081 |
| 1473.0 | 0.078 |
| 1474.0 | 0.08 |
| 1475.0 | 0.079 |
| 1476.0 | 0.078 |
| 1477.0 | 0.08 |
| 1478.0 | 0.078 |
| 1479.0 | 0.078 |
| 1480.0 | 0.082 |
| 1481.0 | 0.076 |
| 1482.0 | 0.08 |
| 1483.0 | 0.079 |
| 1484.0 | 0.078 |
| 1485.0 | 0.08 |
| 1486.0 | 0.079 |
| 1487.0 | 0.078 |
| 1488.0 | 0.079 |
| 1489.0 | 0.078 |
| 1490.0 | 0.083 |
| 1491.0 | 0.082 |
| 1492.0 | 0.081 |
| 1493.0 | 0.079 |
| 1494.0 | 0.078 |
| 1495.0 | 0.079 |
| 1496.0 | 0.079 |
| 1497.0 | 0.079 |
| 1498.0 | 0.081 |
| 1499.0 | 0.079 |
| 1500.0 | 0.081 |
| 1501.0 | 0.078 |
| 1502.0 | 0.079 |
| 1503.0 | 0.081 |
| 1504.0 | 0.079 |
| 1505.0 | 0.078 |
| 1506.0 | 0.08 |
| 1507.0 | 0.082 |
| 1508.0 | 0.079 |
| 1509.0 | 0.081 |
| 1510.0 | 0.08 |
| 1511.0 | 0.079 |
| 1512.0 | 0.077 |
| 1513.0 | 0.078 |
| 1514.0 | 0.081 |
| 1515.0 | 0.079 |
| 1516.0 | 0.081 |
| 1517.0 | 0.078 |
| 1518.0 | 0.082 |
| 1519.0 | 0.08 |
| 1520.0 | 0.077 |
| 1521.0 | 0.078 |
| 1522.0 | 0.079 |
| 1523.0 | 0.077 |
| 1524.0 | 0.081 |
| 1525.0 | 0.08 |
| 1526.0 | 0.08 |
| 1527.0 | 0.081 |
| 1528.0 | 0.08 |
| 1529.0 | 0.079 |
| 1530.0 | 0.082 |
| 1531.0 | 0.081 |
| 1532.0 | 0.079 |
| 1533.0 | 0.08 |
| 1534.0 | 0.079 |
| 1535.0 | 0.077 |
| 1536.0 | 0.08 |
| 1537.0 | 0.08 |
| 1538.0 | 0.08 |
| 1539.0 | 0.077 |
| 1540.0 | 0.079 |
| 1541.0 | 0.082 |
| 1542.0 | 0.078 |
| 1543.0 | 0.079 |
| 1544.0 | 0.08 |
| 1545.0 | 0.079 |
| 1546.0 | 0.081 |
| 1547.0 | 0.078 |
| 1548.0 | 0.081 |
| 1549.0 | 0.081 |
| 1550.0 | 0.08 |
| 1551.0 | 0.078 |
| 1552.0 | 0.079 |
| 1553.0 | 0.079 |
| 1554.0 | 0.08 |
| 1555.0 | 0.08 |
| 1556.0 | 0.078 |
| 1557.0 | 0.081 |
| 1558.0 | 0.08 |
| 1559.0 | 0.082 |
| 1560.0 | 0.078 |
| 1561.0 | 0.081 |
| 1562.0 | 0.078 |
| 1563.0 | 0.078 |
| 1564.0 | 0.083 |
| 1565.0 | 0.081 |
| 1566.0 | 0.079 |
| 1567.0 | 0.08 |
| 1568.0 | 0.079 |
| 1569.0 | 0.08 |
| 1570.0 | 0.079 |
| 1571.0 | 0.08 |
| 1572.0 | 0.08 |
| 1573.0 | 0.081 |
| 1574.0 | 0.081 |
| 1575.0 | 0.081 |
| 1576.0 | 0.078 |
| 1577.0 | 0.08 |
| 1578.0 | 0.08 |
| 1579.0 | 0.08 |
| 1580.0 | 0.08 |
| 1581.0 | 0.081 |
| 1582.0 | 0.078 |
| 1583.0 | 0.078 |
| 1584.0 | 0.079 |
| 1585.0 | 0.079 |
| 1586.0 | 0.079 |
| 1587.0 | 0.079 |
| 1588.0 | 0.08 |
| 1589.0 | 0.079 |
| 1590.0 | 0.08 |
| 1591.0 | 0.082 |
| 1592.0 | 0.08 |
| 1593.0 | 0.079 |
| 1594.0 | 0.079 |
| 1595.0 | 0.078 |
| 1596.0 | 0.081 |
| 1597.0 | 0.079 |
| 1598.0 | 0.079 |
| 1599.0 | 0.08 |
| 1600.0 | 0.081 |
| 1601.0 | 0.08 |
| 1602.0 | 0.083 |
| 1603.0 | 0.083 |
| 1604.0 | 0.081 |
| 1605.0 | 0.078 |
| 1606.0 | 0.084 |
| 1607.0 | 0.079 |
| 1608.0 | 0.081 |
| 1609.0 | 0.079 |
| 1610.0 | 0.081 |
| 1611.0 | 0.079 |
| 1612.0 | 0.077 |
| 1613.0 | 0.081 |
| 1614.0 | 0.08 |
| 1615.0 | 0.081 |
| 1616.0 | 0.08 |
| 1617.0 | 0.082 |
| 1618.0 | 0.077 |
| 1619.0 | 0.081 |
| 1620.0 | 0.08 |
| 1621.0 | 0.081 |
| 1622.0 | 0.078 |
| 1623.0 | 0.08 |
| 1624.0 | 0.081 |
| 1625.0 | 0.08 |
| 1626.0 | 0.08 |
| 1627.0 | 0.082 |
| 1628.0 | 0.079 |
| 1629.0 | 0.08 |
| 1630.0 | 0.079 |
| 1631.0 | 0.081 |
| 1632.0 | 0.083 |
| 1633.0 | 0.081 |
| 1634.0 | 0.079 |
| 1635.0 | 0.08 |
| 1636.0 | 0.082 |
| 1637.0 | 0.08 |
| 1638.0 | 0.078 |
| 1639.0 | 0.079 |
| 1640.0 | 0.081 |
| 1641.0 | 0.079 |
| 1642.0 | 0.079 |
| 1643.0 | 0.08 |
| 1644.0 | 0.079 |
| 1645.0 | 0.082 |
| 1646.0 | 0.082 |
| 1647.0 | 0.078 |
| 1648.0 | 0.082 |
| 1649.0 | 0.079 |
| 1650.0 | 0.077 |
| 1651.0 | 0.082 |
| 1652.0 | 0.081 |
| 1653.0 | 0.079 |
| 1654.0 | 0.079 |
| 1655.0 | 0.08 |
| 1656.0 | 0.078 |
| 1657.0 | 0.082 |
| 1658.0 | 0.08 |
| 1659.0 | 0.081 |
| 1660.0 | 0.079 |
| 1661.0 | 0.082 |
| 1662.0 | 0.081 |
| 1663.0 | 0.079 |
| 1664.0 | 0.082 |
| 1665.0 | 0.081 |
| 1666.0 | 0.08 |
| 1667.0 | 0.082 |
| 1668.0 | 0.08 |
| 1669.0 | 0.082 |
| 1670.0 | 0.082 |
| 1671.0 | 0.08 |
| 1672.0 | 0.08 |
| 1673.0 | 0.077 |
| 1674.0 | 0.08 |
| 1675.0 | 0.08 |
| 1676.0 | 0.08 |
| 1677.0 | 0.08 |
| 1678.0 | 0.081 |
| 1679.0 | 0.08 |
| 1680.0 | 0.08 |
| 1681.0 | 0.081 |
| 1682.0 | 0.082 |
| 1683.0 | 0.082 |
| 1684.0 | 0.082 |
| 1685.0 | 0.081 |
| 1686.0 | 0.079 |
| 1687.0 | 0.08 |
| 1688.0 | 0.081 |
| 1689.0 | 0.08 |
| 1690.0 | 0.082 |
| 1691.0 | 0.077 |
| 1692.0 | 0.077 |
| 1693.0 | 0.081 |
| 1694.0 | 0.078 |
| 1695.0 | 0.08 |
| 1696.0 | 0.081 |
| 1697.0 | 0.081 |
| 1698.0 | 0.081 |
| 1699.0 | 0.08 |
| 1700.0 | 0.082 |
| 1701.0 | 0.079 |
| 1702.0 | 0.08 |
| 1703.0 | 0.081 |
| 1704.0 | 0.081 |
| 1705.0 | 0.081 |
| 1706.0 | 0.08 |
| 1707.0 | 0.082 |
| 1708.0 | 0.078 |
| 1709.0 | 0.079 |
| 1710.0 | 0.078 |
| 1711.0 | 0.079 |
| 1712.0 | 0.08 |
| 1713.0 | 0.077 |
| 1714.0 | 0.08 |
| 1715.0 | 0.081 |
| 1716.0 | 0.082 |
| 1717.0 | 0.082 |
| 1718.0 | 0.078 |
| 1719.0 | 0.081 |
| 1720.0 | 0.08 |
| 1721.0 | 0.08 |
| 1722.0 | 0.081 |
| 1723.0 | 0.081 |
| 1724.0 | 0.08 |
| 1725.0 | 0.082 |
| 1726.0 | 0.08 |
| 1727.0 | 0.081 |
| 1728.0 | 0.08 |
| 1729.0 | 0.079 |
| 1730.0 | 0.08 |
| 1731.0 | 0.079 |
| 1732.0 | 0.08 |
| 1733.0 | 0.08 |
| 1734.0 | 0.081 |
| 1735.0 | 0.082 |
| 1736.0 | 0.079 |
| 1737.0 | 0.079 |
| 1738.0 | 0.079 |
| 1739.0 | 0.079 |
| 1740.0 | 0.08 |
| 1741.0 | 0.081 |
| 1742.0 | 0.08 |
| 1743.0 | 0.079 |
| 1744.0 | 0.079 |
| 1745.0 | 0.079 |
| 1746.0 | 0.08 |
| 1747.0 | 0.079 |
| 1748.0 | 0.08 |
| 1749.0 | 0.079 |
| 1750.0 | 0.079 |
| 1751.0 | 0.082 |
| 1752.0 | 0.081 |
| 1753.0 | 0.083 |
| 1754.0 | 0.082 |
| 1755.0 | 0.078 |
| 1756.0 | 0.081 |
| 1757.0 | 0.081 |
| 1758.0 | 0.08 |
| 1759.0 | 0.083 |
| 1760.0 | 0.081 |
| 1761.0 | 0.081 |
| 1762.0 | 0.081 |
| 1763.0 | 0.079 |
| 1764.0 | 0.08 |
| 1765.0 | 0.078 |
| 1766.0 | 0.08 |
| 1767.0 | 0.08 |
| 1768.0 | 0.08 |
| 1769.0 | 0.079 |
| 1770.0 | 0.082 |
| 1771.0 | 0.08 |
| 1772.0 | 0.081 |
| 1773.0 | 0.081 |
| 1774.0 | 0.08 |
| 1775.0 | 0.077 |
| 1776.0 | 0.08 |
| 1777.0 | 0.078 |
| 1778.0 | 0.081 |
| 1779.0 | 0.08 |
| 1780.0 | 0.08 |
| 1781.0 | 0.082 |
| 1782.0 | 0.079 |
| 1783.0 | 0.078 |
| 1784.0 | 0.084 |
| 1785.0 | 0.081 |
| 1786.0 | 0.082 |
| 1787.0 | 0.079 |
| 1788.0 | 0.08 |
| 1789.0 | 0.079 |
| 1790.0 | 0.079 |
| 1791.0 | 0.078 |
| 1792.0 | 0.079 |
| 1793.0 | 0.082 |
| 1794.0 | 0.078 |
| 1795.0 | 0.08 |
| 1796.0 | 0.081 |
| 1797.0 | 0.081 |
| 1798.0 | 0.077 |
| 1799.0 | 0.08 |
| 1800.0 | 0.079 |
| 1801.0 | 0.08 |
| 1802.0 | 0.082 |
| 1803.0 | 0.08 |
| 1804.0 | 0.08 |
| 1805.0 | 0.081 |
| 1806.0 | 0.082 |
| 1807.0 | 0.082 |
| 1808.0 | 0.08 |
| 1809.0 | 0.083 |
| 1810.0 | 0.081 |
| 1811.0 | 0.079 |
| 1812.0 | 0.079 |
| 1813.0 | 0.08 |
| 1814.0 | 0.079 |
| 1815.0 | 0.077 |
| 1816.0 | 0.083 |
| 1817.0 | 0.075 |
| 1818.0 | 0.08 |
| 1819.0 | 0.08 |
| 1820.0 | 0.077 |
| 1821.0 | 0.08 |
| 1822.0 | 0.08 |
| 1823.0 | 0.079 |
| 1824.0 | 0.079 |
| 1825.0 | 0.079 |
| 1826.0 | 0.08 |
| 1827.0 | 0.079 |
| 1828.0 | 0.08 |
| 1829.0 | 0.08 |
| 1830.0 | 0.079 |
| 1831.0 | 0.082 |
| 1832.0 | 0.081 |
| 1833.0 | 0.08 |
| 1834.0 | 0.079 |
| 1835.0 | 0.081 |
| 1836.0 | 0.077 |
| 1837.0 | 0.078 |
| 1838.0 | 0.082 |
| 1839.0 | 0.079 |
| 1840.0 | 0.078 |
| 1841.0 | 0.08 |
| 1842.0 | 0.08 |
| 1843.0 | 0.08 |
| 1844.0 | 0.08 |
| 1845.0 | 0.078 |
| 1846.0 | 0.081 |
| 1847.0 | 0.078 |
| 1848.0 | 0.079 |
| 1849.0 | 0.081 |
| 1850.0 | 0.08 |
| 1851.0 | 0.081 |
| 1852.0 | 0.081 |
| 1853.0 | 0.08 |
| 1854.0 | 0.078 |
| 1855.0 | 0.08 |
| 1856.0 | 0.079 |
| 1857.0 | 0.08 |
| 1858.0 | 0.082 |
| 1859.0 | 0.079 |
| 1860.0 | 0.081 |
| 1861.0 | 0.081 |
| 1862.0 | 0.081 |
| 1863.0 | 0.081 |
| 1864.0 | 0.083 |
| 1865.0 | 0.08 |
| 1866.0 | 0.079 |
| 1867.0 | 0.079 |
| 1868.0 | 0.081 |
| 1869.0 | 0.08 |
| 1870.0 | 0.079 |
| 1871.0 | 0.081 |
| 1872.0 | 0.08 |
| 1873.0 | 0.08 |
| 1874.0 | 0.08 |
| 1875.0 | 0.082 |
| 1876.0 | 0.08 |
| 1877.0 | 0.081 |
| 1878.0 | 0.08 |
| 1879.0 | 0.081 |
| 1880.0 | 0.081 |
| 1881.0 | 0.079 |
| 1882.0 | 0.081 |
| 1883.0 | 0.079 |
| 1884.0 | 0.078 |
| 1885.0 | 0.08 |
| 1886.0 | 0.078 |
| 1887.0 | 0.079 |
| 1888.0 | 0.079 |
| 1889.0 | 0.079 |
| 1890.0 | 0.078 |
| 1891.0 | 0.081 |
| 1892.0 | 0.078 |
| 1893.0 | 0.081 |
| 1894.0 | 0.08 |
| 1895.0 | 0.081 |
| 1896.0 | 0.078 |
| 1897.0 | 0.077 |
| 1898.0 | 0.078 |
| 1899.0 | 0.081 |
| 1900.0 | 0.078 |
| 1901.0 | 0.079 |
| 1902.0 | 0.081 |
| 1903.0 | 0.079 |
| 1904.0 | 0.08 |
| 1905.0 | 0.079 |
| 1906.0 | 0.079 |
| 1907.0 | 0.079 |
| 1908.0 | 0.078 |
| 1909.0 | 0.078 |
| 1910.0 | 0.081 |
| 1911.0 | 0.08 |
| 1912.0 | 0.079 |
| 1913.0 | 0.079 |
| 1914.0 | 0.081 |
| 1915.0 | 0.08 |
| 1916.0 | 0.08 |
| 1917.0 | 0.079 |
| 1918.0 | 0.076 |
| 1919.0 | 0.079 |
| 1920.0 | 0.078 |
| 1921.0 | 0.079 |
| 1922.0 | 0.078 |
| 1923.0 | 0.081 |
| 1924.0 | 0.081 |
| 1925.0 | 0.078 |
| 1926.0 | 0.079 |
| 1927.0 | 0.078 |
| 1928.0 | 0.078 |
| 1929.0 | 0.082 |
| 1930.0 | 0.076 |
| 1931.0 | 0.08 |
| 1932.0 | 0.078 |
| 1933.0 | 0.08 |
| 1934.0 | 0.079 |
| 1935.0 | 0.078 |
| 1936.0 | 0.08 |
| 1937.0 | 0.079 |
| 1938.0 | 0.079 |
| 1939.0 | 0.079 |
| 1940.0 | 0.082 |
| 1941.0 | 0.082 |
| 1942.0 | 0.079 |
| 1943.0 | 0.079 |
| 1944.0 | 0.081 |
| 1945.0 | 0.077 |
| 1946.0 | 0.079 |
| 1947.0 | 0.081 |
| 1948.0 | 0.075 |
| 1949.0 | 0.078 |
| 1950.0 | 0.079 |
| 1951.0 | 0.08 |
| 1952.0 | 0.077 |
| 1953.0 | 0.077 |
| 1954.0 | 0.078 |
| 1955.0 | 0.078 |
| 1956.0 | 0.077 |
| 1957.0 | 0.081 |
| 1958.0 | 0.077 |
| 1959.0 | 0.08 |
| 1960.0 | 0.079 |
| 1961.0 | 0.076 |
| 1962.0 | 0.078 |
| 1963.0 | 0.079 |
| 1964.0 | 0.078 |
| 1965.0 | 0.08 |
| 1966.0 | 0.078 |
| 1967.0 | 0.079 |
| 1968.0 | 0.081 |
| 1969.0 | 0.079 |
| 1970.0 | 0.079 |
| 1971.0 | 0.079 |
| 1972.0 | 0.08 |
| 1973.0 | 0.08 |
| 1974.0 | 0.078 |
| 1975.0 | 0.08 |
| 1976.0 | 0.077 |
| 1977.0 | 0.078 |
| 1978.0 | 0.08 |
| 1979.0 | 0.078 |
| 1980.0 | 0.079 |
| 1981.0 | 0.082 |
| 1982.0 | 0.077 |
| 1983.0 | 0.077 |
| 1984.0 | 0.079 |
| 1985.0 | 0.079 |
| 1986.0 | 0.078 |
| 1987.0 | 0.079 |
| 1988.0 | 0.078 |
| 1989.0 | 0.076 |
| 1990.0 | 0.08 |
| 1991.0 | 0.08 |
| 1992.0 | 0.077 |
| 1993.0 | 0.08 |
| 1994.0 | 0.079 |
| 1995.0 | 0.079 |
| 1996.0 | 0.082 |
| 1997.0 | 0.083 |
| 1998.0 | 0.079 |
| 1999.0 | 0.084 |
| 2000.0 | 0.078 |
| 2001.0 | 0.078 |
| 2002.0 | 0.076 |
| 2003.0 | 0.076 |
| 2004.0 | 0.076 |
| 2005.0 | 0.076 |
| 2006.0 | 0.079 |
| 2007.0 | 0.078 |
| 2008.0 | 0.079 |
| 2009.0 | 0.077 |
| 2010.0 | 0.077 |
| 2011.0 | 0.08 |
| 2012.0 | 0.075 |
| 2013.0 | 0.082 |
| 2014.0 | 0.078 |
| 2015.0 | 0.078 |
| 2016.0 | 0.079 |
| 2017.0 | 0.078 |
| 2018.0 | 0.078 |
| 2019.0 | 0.079 |
| 2020.0 | 0.078 |
| 2021.0 | 0.078 |
| 2022.0 | 0.077 |
| 2023.0 | 0.079 |
| 2024.0 | 0.08 |
| 2025.0 | 0.076 |
| 2026.0 | 0.077 |
| 2027.0 | 0.076 |
| 2028.0 | 0.076 |
| 2029.0 | 0.077 |
| 2030.0 | 0.077 |
| 2031.0 | 0.078 |
| 2032.0 | 0.079 |
| 2033.0 | 0.08 |
| 2034.0 | 0.078 |
| 2035.0 | 0.078 |
| 2036.0 | 0.078 |
| 2037.0 | 0.079 |
| 2038.0 | 0.078 |
| 2039.0 | 0.077 |
| 2040.0 | 0.077 |
| 2041.0 | 0.076 |
| 2042.0 | 0.078 |
| 2043.0 | 0.077 |
| 2044.0 | 0.078 |
| 2045.0 | 0.08 |
| 2046.0 | 0.078 |
| 2047.0 | 0.076 |
| 2048.0 | 0.076 |
| 2049.0 | 0.079 |
| 2050.0 | 0.077 |
| 2051.0 | 0.078 |
| 2052.0 | 0.074 |
| 2053.0 | 0.079 |
| 2054.0 | 0.077 |
| 2055.0 | 0.077 |
| 2056.0 | 0.079 |
| 2057.0 | 0.076 |
| 2058.0 | 0.079 |
| 2059.0 | 0.076 |
| 2060.0 | 0.078 |
| 2061.0 | 0.076 |
| 2062.0 | 0.077 |
| 2063.0 | 0.078 |
| 2064.0 | 0.076 |
| 2065.0 | 0.078 |
| 2066.0 | 0.077 |
| 2067.0 | 0.078 |
| 2068.0 | 0.08 |
| 2069.0 | 0.079 |
| 2070.0 | 0.08 |
| 2071.0 | 0.077 |
| 2072.0 | 0.077 |
| 2073.0 | 0.078 |
| 2074.0 | 0.079 |
| 2075.0 | 0.079 |
| 2076.0 | 0.077 |
| 2077.0 | 0.076 |
| 2078.0 | 0.076 |
| 2079.0 | 0.078 |
| 2080.0 | 0.078 |
| 2081.0 | 0.077 |
| 2082.0 | 0.078 |
| 2083.0 | 0.076 |
| 2084.0 | 0.079 |
| 2085.0 | 0.075 |
| 2086.0 | 0.076 |
| 2087.0 | 0.077 |
| 2088.0 | 0.077 |
| 2089.0 | 0.077 |
| 2090.0 | 0.076 |
| 2091.0 | 0.078 |
| 2092.0 | 0.079 |
| 2093.0 | 0.078 |
| 2094.0 | 0.077 |
| 2095.0 | 0.078 |
| 2096.0 | 0.077 |
| 2097.0 | 0.078 |
| 2098.0 | 0.075 |
| 2099.0 | 0.077 |
| 2100.0 | 0.076 |
| 2101.0 | 0.078 |
| 2102.0 | 0.075 |
| 2103.0 | 0.077 |
| 2104.0 | 0.076 |
| 2105.0 | 0.078 |
| 2106.0 | 0.077 |
| 2107.0 | 0.075 |
| 2108.0 | 0.077 |
| 2109.0 | 0.077 |
| 2110.0 | 0.079 |
| 2111.0 | 0.077 |
| 2112.0 | 0.078 |
| 2113.0 | 0.078 |
| 2114.0 | 0.077 |
| 2115.0 | 0.077 |
| 2116.0 | 0.079 |
| 2117.0 | 0.076 |
| 2118.0 | 0.078 |
| 2119.0 | 0.078 |
| 2120.0 | 0.076 |
| 2121.0 | 0.075 |
| 2122.0 | 0.077 |
| 2123.0 | 0.075 |
| 2124.0 | 0.079 |
| 2125.0 | 0.077 |
| 2126.0 | 0.078 |
| 2127.0 | 0.076 |
| 2128.0 | 0.076 |
| 2129.0 | 0.077 |
| 2130.0 | 0.077 |
| 2131.0 | 0.078 |
| 2132.0 | 0.075 |
| 2133.0 | 0.076 |
| 2134.0 | 0.076 |
| 2135.0 | 0.075 |
| 2136.0 | 0.078 |
| 2137.0 | 0.078 |
| 2138.0 | 0.077 |
| 2139.0 | 0.077 |
| 2140.0 | 0.076 |
| 2141.0 | 0.075 |
| 2142.0 | 0.078 |
| 2143.0 | 0.076 |
| 2144.0 | 0.078 |
| 2145.0 | 0.075 |
| 2146.0 | 0.077 |
| 2147.0 | 0.076 |
| 2148.0 | 0.075 |
| 2149.0 | 0.076 |
| 2150.0 | 0.075 |
| 2151.0 | 0.079 |
| 2152.0 | 0.078 |
| 2153.0 | 0.077 |
| 2154.0 | 0.074 |
| 2155.0 | 0.076 |
| 2156.0 | 0.077 |
| 2157.0 | 0.075 |
| 2158.0 | 0.079 |
| 2159.0 | 0.075 |
| 2160.0 | 0.076 |
| 2161.0 | 0.076 |
| 2162.0 | 0.077 |
| 2163.0 | 0.079 |
| 2164.0 | 0.076 |
| 2165.0 | 0.075 |
| 2166.0 | 0.077 |
| 2167.0 | 0.077 |
| 2168.0 | 0.075 |
| 2169.0 | 0.076 |
| 2170.0 | 0.077 |
| 2171.0 | 0.076 |
| 2172.0 | 0.076 |
| 2173.0 | 0.077 |
| 2174.0 | 0.075 |
| 2175.0 | 0.079 |
| 2176.0 | 0.078 |
| 2177.0 | 0.075 |
| 2178.0 | 0.077 |
| 2179.0 | 0.077 |
| 2180.0 | 0.076 |
| 2181.0 | 0.078 |
| 2182.0 | 0.077 |
| 2183.0 | 0.076 |
| 2184.0 | 0.075 |
| 2185.0 | 0.075 |
| 2186.0 | 0.076 |
| 2187.0 | 0.075 |
| 2188.0 | 0.076 |
| 2189.0 | 0.075 |
| 2190.0 | 0.075 |
| 2191.0 | 0.075 |
| 2192.0 | 0.073 |
| 2193.0 | 0.076 |
| 2194.0 | 0.074 |
| 2195.0 | 0.076 |
| 2196.0 | 0.076 |
| 2197.0 | 0.078 |
| 2198.0 | 0.077 |
| 2199.0 | 0.073 |
| 2200.0 | 0.078 |
| 2201.0 | 0.076 |
| 2202.0 | 0.076 |
| 2203.0 | 0.074 |
| 2204.0 | 0.072 |
| 2205.0 | 0.074 |
| 2206.0 | 0.073 |
| 2207.0 | 0.073 |
| 2208.0 | 0.075 |
| 2209.0 | 0.074 |
| 2210.0 | 0.074 |
| 2211.0 | 0.075 |
| 2212.0 | 0.077 |
| 2213.0 | 0.077 |
| 2214.0 | 0.076 |
| 2215.0 | 0.075 |
| 2216.0 | 0.075 |
| 2217.0 | 0.076 |
| 2218.0 | 0.076 |
| 2219.0 | 0.075 |
| 2220.0 | 0.075 |
| 2221.0 | 0.075 |
| 2222.0 | 0.076 |
| 2223.0 | 0.076 |
| 2224.0 | 0.075 |
| 2225.0 | 0.075 |
| 2226.0 | 0.075 |
| 2227.0 | 0.076 |
| 2228.0 | 0.075 |
| 2229.0 | 0.076 |
| 2230.0 | 0.075 |
| 2231.0 | 0.075 |
| 2232.0 | 0.076 |
| 2233.0 | 0.075 |
| 2234.0 | 0.074 |
| 2235.0 | 0.075 |
| 2236.0 | 0.076 |
| 2237.0 | 0.076 |
| 2238.0 | 0.077 |
| 2239.0 | 0.074 |
| 2240.0 | 0.076 |
| 2241.0 | 0.078 |
| 2242.0 | 0.076 |
| 2243.0 | 0.078 |
| 2244.0 | 0.076 |
| 2245.0 | 0.077 |
| 2246.0 | 0.076 |
| 2247.0 | 0.077 |
| 2248.0 | 0.076 |
| 2249.0 | 0.076 |
| 2250.0 | 0.075 |
| 2251.0 | 0.076 |
| 2252.0 | 0.075 |
| 2253.0 | 0.078 |
| 2254.0 | 0.076 |
| 2255.0 | 0.074 |
| 2256.0 | 0.074 |
| 2257.0 | 0.077 |
| 2258.0 | 0.079 |
| 2259.0 | 0.077 |
| 2260.0 | 0.078 |
| 2261.0 | 0.078 |
| 2262.0 | 0.077 |
| 2263.0 | 0.077 |
| 2264.0 | 0.076 |
| 2265.0 | 0.079 |
| 2266.0 | 0.08 |
| 2267.0 | 0.077 |
| 2268.0 | 0.075 |
| 2269.0 | 0.076 |
| 2270.0 | 0.076 |
| 2271.0 | 0.077 |
| 2272.0 | 0.078 |
| 2273.0 | 0.075 |
| 2274.0 | 0.078 |
| 2275.0 | 0.076 |
| 2276.0 | 0.079 |
| 2277.0 | 0.079 |
| 2278.0 | 0.078 |
| 2279.0 | 0.075 |
| 2280.0 | 0.076 |
| 2281.0 | 0.076 |
| 2282.0 | 0.077 |
| 2283.0 | 0.075 |
| 2284.0 | 0.075 |
| 2285.0 | 0.076 |
| 2286.0 | 0.078 |
| 2287.0 | 0.075 |
| 2288.0 | 0.077 |
| 2289.0 | 0.076 |
| 2290.0 | 0.076 |
| 2291.0 | 0.075 |
| 2292.0 | 0.075 |
| 2293.0 | 0.075 |
| 2294.0 | 0.076 |
| 2295.0 | 0.078 |
| 2296.0 | 0.076 |
| 2297.0 | 0.074 |
| 2298.0 | 0.076 |
| 2299.0 | 0.075 |
| 2300.0 | 0.073 |
| 2301.0 | 0.076 |
| 2302.0 | 0.075 |
| 2303.0 | 0.075 |
| 2304.0 | 0.074 |
| 2305.0 | 0.077 |
| 2306.0 | 0.076 |
| 2307.0 | 0.077 |
| 2308.0 | 0.075 |
| 2309.0 | 0.075 |
| 2310.0 | 0.074 |
| 2311.0 | 0.074 |
| 2312.0 | 0.074 |
| 2313.0 | 0.075 |
| 2314.0 | 0.074 |
| 2315.0 | 0.075 |
| 2316.0 | 0.075 |
| 2317.0 | 0.074 |
| 2318.0 | 0.074 |
| 2319.0 | 0.076 |
| 2320.0 | 0.075 |
| 2321.0 | 0.076 |
| 2322.0 | 0.074 |
| 2323.0 | 0.074 |
| 2324.0 | 0.073 |
| 2325.0 | 0.078 |
| 2326.0 | 0.075 |
| 2327.0 | 0.074 |
| 2328.0 | 0.074 |
| 2329.0 | 0.073 |
| 2330.0 | 0.075 |
| 2331.0 | 0.075 |
| 2332.0 | 0.074 |
| 2333.0 | 0.073 |
| 2334.0 | 0.076 |
| 2335.0 | 0.076 |
| 2336.0 | 0.074 |
| 2337.0 | 0.074 |
| 2338.0 | 0.076 |
| 2339.0 | 0.076 |
| 2340.0 | 0.073 |
| 2341.0 | 0.075 |
| 2342.0 | 0.075 |
| 2343.0 | 0.076 |
| 2344.0 | 0.074 |
| 2345.0 | 0.074 |
| 2346.0 | 0.075 |
| 2347.0 | 0.074 |
| 2348.0 | 0.075 |
| 2349.0 | 0.075 |
| 2350.0 | 0.076 |
| 2351.0 | 0.076 |
| 2352.0 | 0.074 |
| 2353.0 | 0.074 |
| 2354.0 | 0.073 |
| 2355.0 | 0.075 |
| 2356.0 | 0.076 |
| 2357.0 | 0.072 |
| 2358.0 | 0.075 |
| 2359.0 | 0.075 |
| 2360.0 | 0.076 |
| 2361.0 | 0.076 |
| 2362.0 | 0.075 |
| 2363.0 | 0.076 |
| 2364.0 | 0.072 |
| 2365.0 | 0.075 |
| 2366.0 | 0.076 |
| 2367.0 | 0.073 |
| 2368.0 | 0.074 |
| 2369.0 | 0.075 |
| 2370.0 | 0.076 |
| 2371.0 | 0.073 |
| 2372.0 | 0.076 |
| 2373.0 | 0.075 |
| 2374.0 | 0.07 |
| 2375.0 | 0.077 |
| 2376.0 | 0.075 |
| 2377.0 | 0.074 |
| 2378.0 | 0.074 |
| 2379.0 | 0.077 |
| 2380.0 | 0.074 |
| 2381.0 | 0.074 |
| 2382.0 | 0.074 |
| 2383.0 | 0.075 |
| 2384.0 | 0.074 |
| 2385.0 | 0.074 |
| 2386.0 | 0.075 |
| 2387.0 | 0.076 |
| 2388.0 | 0.073 |
| 2389.0 | 0.075 |
| 2390.0 | 0.074 |
| 2391.0 | 0.075 |
| 2392.0 | 0.075 |
| 2393.0 | 0.076 |
| 2394.0 | 0.073 |
| 2395.0 | 0.075 |
| 2396.0 | 0.074 |
| 2397.0 | 0.072 |
| 2398.0 | 0.075 |
| 2399.0 | 0.077 |
| 2400.0 | 0.077 |
| 2401.0 | 0.073 |
| 2402.0 | 0.074 |
| 2403.0 | 0.074 |
| 2404.0 | 0.075 |
| 2405.0 | 0.076 |
| 2406.0 | 0.075 |
| 2407.0 | 0.076 |
| 2408.0 | 0.075 |
| 2409.0 | 0.076 |
| 2410.0 | 0.074 |
| 2411.0 | 0.076 |
| 2412.0 | 0.076 |
| 2413.0 | 0.075 |
| 2414.0 | 0.075 |
| 2415.0 | 0.074 |
| 2416.0 | 0.075 |
| 2417.0 | 0.074 |
| 2418.0 | 0.076 |
| 2419.0 | 0.075 |
| 2420.0 | 0.075 |
| 2421.0 | 0.073 |
| 2422.0 | 0.077 |
| 2423.0 | 0.075 |
| 2424.0 | 0.073 |
| 2425.0 | 0.075 |
| 2426.0 | 0.073 |
| 2427.0 | 0.076 |
| 2428.0 | 0.076 |
| 2429.0 | 0.073 |
| 2430.0 | 0.075 |
| 2431.0 | 0.075 |
| 2432.0 | 0.074 |
| 2433.0 | 0.077 |
| 2434.0 | 0.075 |
| 2435.0 | 0.074 |
| 2436.0 | 0.075 |
| 2437.0 | 0.072 |
| 2438.0 | 0.077 |
| 2439.0 | 0.074 |
| 2440.0 | 0.076 |
| 2441.0 | 0.075 |
| 2442.0 | 0.075 |
| 2443.0 | 0.074 |
| 2444.0 | 0.076 |
| 2445.0 | 0.075 |
| 2446.0 | 0.076 |
| 2447.0 | 0.077 |
| 2448.0 | 0.076 |
| 2449.0 | 0.075 |
| 2450.0 | 0.077 |
| 2451.0 | 0.074 |
| 2452.0 | 0.076 |
| 2453.0 | 0.075 |
| 2454.0 | 0.076 |
| 2455.0 | 0.074 |
| 2456.0 | 0.076 |
| 2457.0 | 0.072 |
| 2458.0 | 0.076 |
| 2459.0 | 0.075 |
| 2460.0 | 0.077 |
| 2461.0 | 0.075 |
| 2462.0 | 0.074 |
| 2463.0 | 0.074 |
| 2464.0 | 0.076 |
| 2465.0 | 0.074 |
| 2466.0 | 0.076 |
| 2467.0 | 0.075 |
| 2468.0 | 0.074 |
| 2469.0 | 0.075 |
| 2470.0 | 0.073 |
| 2471.0 | 0.074 |
| 2472.0 | 0.075 |
| 2473.0 | 0.075 |
| 2474.0 | 0.077 |
| 2475.0 | 0.074 |
| 2476.0 | 0.075 |
| 2477.0 | 0.072 |
| 2478.0 | 0.075 |
| 2479.0 | 0.075 |
| 2480.0 | 0.076 |
| 2481.0 | 0.077 |
| 2482.0 | 0.073 |
| 2483.0 | 0.076 |
| 2484.0 | 0.077 |
| 2485.0 | 0.076 |
| 2486.0 | 0.075 |
| 2487.0 | 0.076 |
| 2488.0 | 0.075 |
| 2489.0 | 0.075 |
| 2490.0 | 0.076 |
| 2491.0 | 0.075 |
| 2492.0 | 0.073 |
| 2493.0 | 0.076 |
| 2494.0 | 0.075 |
| 2495.0 | 0.078 |
| 2496.0 | 0.076 |
| 2497.0 | 0.075 |
| 2498.0 | 0.076 |
| 2499.0 | 0.076 |
| 2500.0 | 0.075 |
| 2501.0 | 0.075 |
| 2502.0 | 0.075 |
| 2503.0 | 0.075 |
| 2504.0 | 0.076 |
| 2505.0 | 0.074 |
| 2506.0 | 0.076 |
| 2507.0 | 0.075 |
| 2508.0 | 0.075 |
| 2509.0 | 0.078 |
| 2510.0 | 0.077 |
| 2511.0 | 0.077 |
| 2512.0 | 0.075 |
| 2513.0 | 0.074 |
| 2514.0 | 0.078 |
| 2515.0 | 0.075 |
| 2516.0 | 0.076 |
| 2517.0 | 0.075 |
| 2518.0 | 0.075 |
| 2519.0 | 0.076 |
| 2520.0 | 0.076 |
| 2521.0 | 0.074 |
| 2522.0 | 0.076 |
| 2523.0 | 0.077 |
| 2524.0 | 0.075 |
| 2525.0 | 0.076 |
| 2526.0 | 0.075 |
| 2527.0 | 0.076 |
| 2528.0 | 0.077 |
| 2529.0 | 0.075 |
| 2530.0 | 0.076 |
| 2531.0 | 0.075 |
| 2532.0 | 0.075 |
| 2533.0 | 0.074 |
| 2534.0 | 0.076 |
| 2535.0 | 0.076 |
| 2536.0 | 0.075 |
| 2537.0 | 0.076 |
| 2538.0 | 0.074 |
| 2539.0 | 0.076 |
| 2540.0 | 0.074 |
| 2541.0 | 0.077 |
| 2542.0 | 0.077 |
| 2543.0 | 0.074 |
| 2544.0 | 0.076 |
| 2545.0 | 0.074 |
| 2546.0 | 0.078 |
| 2547.0 | 0.077 |
| 2548.0 | 0.076 |
| 2549.0 | 0.076 |
| 2550.0 | 0.077 |
| 2551.0 | 0.076 |
| 2552.0 | 0.077 |
| 2553.0 | 0.076 |
| 2554.0 | 0.077 |
| 2555.0 | 0.076 |
| 2556.0 | 0.076 |
| 2557.0 | 0.075 |
| 2558.0 | 0.076 |
| 2559.0 | 0.077 |
| 2560.0 | 0.074 |
| 2561.0 | 0.073 |
| 2562.0 | 0.076 |
| 2563.0 | 0.076 |
| 2564.0 | 0.076 |
| 2565.0 | 0.076 |
| 2566.0 | 0.075 |
| 2567.0 | 0.078 |
| 2568.0 | 0.076 |
| 2569.0 | 0.076 |
| 2570.0 | 0.074 |
| 2571.0 | 0.075 |
| 2572.0 | 0.075 |
| 2573.0 | 0.073 |
| 2574.0 | 0.076 |
| 2575.0 | 0.075 |
| 2576.0 | 0.077 |
| 2577.0 | 0.075 |
| 2578.0 | 0.076 |
| 2579.0 | 0.074 |
| 2580.0 | 0.074 |
| 2581.0 | 0.074 |
| 2582.0 | 0.075 |
| 2583.0 | 0.076 |
| 2584.0 | 0.077 |
| 2585.0 | 0.077 |
| 2586.0 | 0.075 |
| 2587.0 | 0.077 |
| 2588.0 | 0.077 |
| 2589.0 | 0.074 |
| 2590.0 | 0.078 |
| 2591.0 | 0.074 |
| 2592.0 | 0.076 |
| 2593.0 | 0.076 |
| 2594.0 | 0.075 |
| 2595.0 | 0.074 |
| 2596.0 | 0.077 |
| 2597.0 | 0.075 |
| 2598.0 | 0.074 |
| 2599.0 | 0.076 |
| 2600.0 | 0.076 |
| 2601.0 | 0.075 |
| 2602.0 | 0.076 |
| 2603.0 | 0.077 |
| 2604.0 | 0.076 |
| 2605.0 | 0.077 |
| 2606.0 | 0.075 |
| 2607.0 | 0.076 |
| 2608.0 | 0.077 |
| 2609.0 | 0.075 |
| 2610.0 | 0.078 |
| 2611.0 | 0.077 |
| 2612.0 | 0.077 |
| 2613.0 | 0.077 |
| 2614.0 | 0.077 |
| 2615.0 | 0.078 |
| 2616.0 | 0.075 |
| 2617.0 | 0.077 |
| 2618.0 | 0.075 |
| 2619.0 | 0.074 |
| 2620.0 | 0.075 |
| 2621.0 | 0.075 |
| 2622.0 | 0.074 |
| 2623.0 | 0.077 |
| 2624.0 | 0.075 |
| 2625.0 | 0.075 |
| 2626.0 | 0.076 |
| 2627.0 | 0.077 |
| 2628.0 | 0.075 |
| 2629.0 | 0.074 |
| 2630.0 | 0.078 |
| 2631.0 | 0.079 |
| 2632.0 | 0.074 |
| 2633.0 | 0.077 |
| 2634.0 | 0.075 |
| 2635.0 | 0.075 |
| 2636.0 | 0.074 |
| 2637.0 | 0.077 |
| 2638.0 | 0.075 |
| 2639.0 | 0.078 |
| 2640.0 | 0.074 |
| 2641.0 | 0.076 |
| 2642.0 | 0.078 |
| 2643.0 | 0.076 |
| 2644.0 | 0.077 |
| 2645.0 | 0.075 |
| 2646.0 | 0.075 |
| 2647.0 | 0.079 |
| 2648.0 | 0.077 |
| 2649.0 | 0.076 |
| 2650.0 | 0.075 |
| 2651.0 | 0.077 |
| 2652.0 | 0.076 |
| 2653.0 | 0.075 |
| 2654.0 | 0.075 |
| 2655.0 | 0.073 |
| 2656.0 | 0.073 |
| 2657.0 | 0.073 |
| 2658.0 | 0.075 |
| 2659.0 | 0.075 |
| 2660.0 | 0.079 |
| 2661.0 | 0.076 |
| 2662.0 | 0.081 |
| 2663.0 | 0.082 |
| 2664.0 | 0.08 |
| 2665.0 | 0.082 |
| 2666.0 | 0.081 |
| 2667.0 | 0.082 |
| 2668.0 | 0.083 |
| 2669.0 | 0.082 |
| 2670.0 | 0.086 |
| 2671.0 | 0.08 |
| 2672.0 | 0.082 |
| 2673.0 | 0.086 |
| 2674.0 | 0.089 |
| 2675.0 | 0.087 |
| 2676.0 | 0.088 |
| 2677.0 | 0.087 |
| 2678.0 | 0.09 |
| 2679.0 | 0.087 |
| 2680.0 | 0.087 |
| 2681.0 | 0.088 |
| 2682.0 | 0.09 |
| 2683.0 | 0.08 |
| 2684.0 | 0.083 |
| 2685.0 | 0.083 |
| 2686.0 | 0.087 |
| 2687.0 | 0.083 |
| 2688.0 | 0.085 |
| 2689.0 | 0.086 |
| 2690.0 | 0.086 |
| 2691.0 | 0.082 |
| 2692.0 | 0.082 |
| 2693.0 | 0.083 |
| 2694.0 | 0.083 |
| 2695.0 | 0.084 |
| 2696.0 | 0.079 |
| 2697.0 | 0.086 |
| 2698.0 | 0.081 |
| 2699.0 | 0.081 |
| 2700.0 | 0.081 |
| 2701.0 | 0.08 |
| 2702.0 | 0.083 |
| 2703.0 | 0.084 |
| 2704.0 | 0.08 |
| 2705.0 | 0.085 |
| 2706.0 | 0.085 |
| 2707.0 | 0.081 |
| 2708.0 | 0.086 |
| 2709.0 | 0.084 |
| 2710.0 | 0.082 |
| 2711.0 | 0.084 |
| 2712.0 | 0.08 |
| 2713.0 | 0.08 |
| 2714.0 | 0.085 |
| 2715.0 | 0.082 |
| 2716.0 | 0.086 |
| 2717.0 | 0.083 |
| 2718.0 | 0.083 |
| 2719.0 | 0.081 |
| 2720.0 | 0.085 |
| 2721.0 | 0.086 |
| 2722.0 | 0.085 |
| 2723.0 | 0.093 |
| 2724.0 | 0.082 |
| 2725.0 | 0.084 |
| 2726.0 | 0.086 |
| 2727.0 | 0.085 |
| 2728.0 | 0.083 |
| 2729.0 | 0.084 |
| 2730.0 | 0.087 |
| 2731.0 | 0.084 |
| 2732.0 | 0.085 |
| 2733.0 | 0.086 |
| 2734.0 | 0.081 |
| 2735.0 | 0.083 |
| 2736.0 | 0.087 |
| 2737.0 | 0.088 |
| 2738.0 | 0.082 |
| 2739.0 | 0.079 |
| 2740.0 | 0.091 |
| 2741.0 | 0.087 |
| 2742.0 | 0.086 |
| 2743.0 | 0.085 |
| 2744.0 | 0.084 |
| 2745.0 | 0.086 |
| 2746.0 | 0.084 |
| 2747.0 | 0.088 |
| 2748.0 | 0.084 |
| 2749.0 | 0.089 |
| 2750.0 | 0.089 |
| 2751.0 | 0.085 |
| 2752.0 | 0.092 |
| 2753.0 | 0.091 |
| 2754.0 | 0.084 |
| 2755.0 | 0.091 |
| 2756.0 | 0.091 |
| 2757.0 | 0.089 |
| 2758.0 | 0.089 |
| 2759.0 | 0.092 |
| 2760.0 | 0.093 |
| 2761.0 | 0.089 |
| 2762.0 | 0.093 |
| 2763.0 | 0.091 |
| 2764.0 | 0.092 |
| 2765.0 | 0.094 |
| 2766.0 | 0.103 |
| 2767.0 | 0.093 |
| 2768.0 | 0.09 |
| 2769.0 | 0.096 |
| 2770.0 | 0.095 |
| 2771.0 | 0.09 |
| 2772.0 | 0.084 |
| 2773.0 | 0.096 |
| 2774.0 | 0.095 |
| 2775.0 | 0.095 |
| 2776.0 | 0.085 |
| 2777.0 | 0.094 |
| 2778.0 | 0.086 |
| 2779.0 | 0.09 |
| 2780.0 | 0.086 |
| 2781.0 | 0.087 |
| 2782.0 | 0.089 |
| 2783.0 | 0.084 |
| 2784.0 | 0.086 |
| 2785.0 | 0.083 |
| 2786.0 | 0.083 |
| 2787.0 | 0.087 |
| 2788.0 | 0.085 |
| 2789.0 | 0.085 |
| 2790.0 | 0.084 |
| 2791.0 | 0.085 |
| 2792.0 | 0.088 |
| 2793.0 | 0.086 |
| 2794.0 | 0.086 |
| 2795.0 | 0.083 |
| 2796.0 | 0.081 |
| 2797.0 | 0.087 |
| 2798.0 | 0.081 |
| 2799.0 | 0.077 |
| 2800.0 | 0.088 |
| 2801.0 | 0.084 |
| 2802.0 | 0.085 |
| 2803.0 | 0.081 |
| 2804.0 | 0.088 |
| 2805.0 | 0.08 |
| 2806.0 | 0.083 |
| 2807.0 | 0.079 |
| 2808.0 | 0.085 |
| 2809.0 | 0.081 |
| 2810.0 | 0.084 |
| 2811.0 | 0.081 |
| 2812.0 | 0.086 |
| 2813.0 | 0.082 |
| 2814.0 | 0.082 |
| 2815.0 | 0.082 |
| 2816.0 | 0.083 |
| 2817.0 | 0.079 |
| 2818.0 | 0.079 |
| 2819.0 | 0.08 |
| 2820.0 | 0.082 |
| 2821.0 | 0.079 |
| 2822.0 | 0.086 |
| 2823.0 | 0.08 |
| 2824.0 | 0.079 |
| 2825.0 | 0.084 |
| 2826.0 | 0.083 |
| 2827.0 | 0.082 |
| 2828.0 | 0.084 |
| 2829.0 | 0.079 |
| 2830.0 | 0.079 |
| 2831.0 | 0.085 |
| 2832.0 | 0.084 |
| 2833.0 | 0.083 |
| 2834.0 | 0.083 |
| 2835.0 | 0.077 |
| 2836.0 | 0.079 |
| 2837.0 | 0.08 |
| 2838.0 | 0.082 |
| 2839.0 | 0.082 |
| 2840.0 | 0.081 |
| 2841.0 | 0.079 |
| 2842.0 | 0.084 |
| 2843.0 | 0.08 |
| 2844.0 | 0.08 |
| 2845.0 | 0.079 |
| 2846.0 | 0.079 |
| 2847.0 | 0.082 |
| 2848.0 | 0.083 |
| 2849.0 | 0.08 |
| 2850.0 | 0.083 |
| 2851.0 | 0.082 |
| 2852.0 | 0.078 |
| 2853.0 | 0.084 |
| 2854.0 | 0.082 |
| 2855.0 | 0.085 |
| 2856.0 | 0.082 |
| 2857.0 | 0.082 |
| 2858.0 | 0.085 |
| 2859.0 | 0.081 |
| 2860.0 | 0.083 |
| 2861.0 | 0.085 |
| 2862.0 | 0.081 |
| 2863.0 | 0.082 |
| 2864.0 | 0.083 |
| 2865.0 | 0.084 |
| 2866.0 | 0.083 |
| 2867.0 | 0.082 |
| 2868.0 | 0.078 |
| 2869.0 | 0.084 |
| 2870.0 | 0.081 |
| 2871.0 | 0.082 |
| 2872.0 | 0.082 |
| 2873.0 | 0.082 |
| 2874.0 | 0.08 |
| 2875.0 | 0.082 |
| 2876.0 | 0.086 |
| 2877.0 | 0.087 |
| 2878.0 | 0.083 |
| 2879.0 | 0.084 |
| 2880.0 | 0.082 |
| 2881.0 | 0.079 |
| 2882.0 | 0.086 |
| 2883.0 | 0.083 |
| 2884.0 | 0.085 |
| 2885.0 | 0.082 |
| 2886.0 | 0.084 |
| 2887.0 | 0.084 |
| 2888.0 | 0.09 |
| 2889.0 | 0.085 |
| 2890.0 | 0.085 |
| 2891.0 | 0.086 |
| 2892.0 | 0.084 |
| 2893.0 | 0.088 |
| 2894.0 | 0.091 |
| 2895.0 | 0.089 |
| 2896.0 | 0.083 |
| 2897.0 | 0.086 |
| 2898.0 | 0.088 |
| 2899.0 | 0.09 |
| 2900.0 | 0.088 |
| 2901.0 | 0.084 |
| 2902.0 | 0.086 |
| 2903.0 | 0.092 |
| 2904.0 | 0.092 |
| 2905.0 | 0.09 |
| 2906.0 | 0.09 |
| 2907.0 | 0.088 |
| 2908.0 | 0.092 |
| 2909.0 | 0.091 |
| 2910.0 | 0.092 |
| 2911.0 | 0.088 |
| 2912.0 | 0.089 |
| 2913.0 | 0.09 |
| 2914.0 | 0.088 |
| 2915.0 | 0.091 |
| 2916.0 | 0.092 |
| 2917.0 | 0.092 |
| 2918.0 | 0.09 |
| 2919.0 | 0.09 |
| 2920.0 | 0.091 |
| 2921.0 | 0.092 |
| 2922.0 | 0.093 |
| 2923.0 | 0.093 |
| 2924.0 | 0.087 |
| 2925.0 | 0.087 |
| 2926.0 | 0.092 |
| 2927.0 | 0.094 |
| 2928.0 | 0.093 |
| 2929.0 | 0.094 |
| 2930.0 | 0.092 |
| 2931.0 | 0.088 |
| 2932.0 | 0.091 |
| 2933.0 | 0.099 |
| 2934.0 | 0.099 |
| 2935.0 | 0.099 |
| 2936.0 | 0.091 |
| 2937.0 | 0.101 |
| 2938.0 | 0.104 |
| 2939.0 | 0.102 |
| 2940.0 | 0.098 |
| 2941.0 | 0.105 |
| 2942.0 | 0.099 |
| 2943.0 | 0.109 |
| 2944.0 | 0.096 |
| 2945.0 | 0.108 |
| 2946.0 | 0.097 |
| 2947.0 | 0.1 |
| 2948.0 | 0.092 |
| 2949.0 | 0.092 |
| 2950.0 | 0.095 |
| 2951.0 | 0.098 |
| 2952.0 | 0.092 |
| 2953.0 | 0.091 |
| 2954.0 | 0.102 |
| 2955.0 | 0.103 |
| 2956.0 | 0.101 |
| 2957.0 | 0.105 |
| 2958.0 | 0.104 |
| 2959.0 | 0.111 |
| 2960.0 | 0.103 |
| 2961.0 | 0.097 |
| 2962.0 | 0.103 |
| 2963.0 | 0.091 |
| 2964.0 | 0.117 |
| 2965.0 | 0.108 |
| 2966.0 | 0.103 |
| 2967.0 | 0.102 |
| 2968.0 | 0.101 |
| 2969.0 | 0.105 |
| 2970.0 | 0.106 |
| 2971.0 | 0.115 |
| 2972.0 | 0.11 |
| 2973.0 | 0.111 |
| 2974.0 | 0.102 |
| 2975.0 | 0.114 |
| 2976.0 | 0.107 |
| 2977.0 | 0.116 |
| 2978.0 | 0.113 |
| 2979.0 | 0.114 |
| 2980.0 | 0.109 |
| 2981.0 | 0.124 |
| 2982.0 | 0.114 |
| 2983.0 | 0.118 |
| 2984.0 | 0.108 |
| 2985.0 | 0.119 |
| 2986.0 | 0.118 |
| 2987.0 | 0.112 |
| 2988.0 | 0.125 |
| 2989.0 | 0.113 |
| 2990.0 | 0.114 |
| 2991.0 | 0.131 |
| 2992.0 | 0.115 |
| 2993.0 | 0.12 |
| 2994.0 | 0.116 |
| 2995.0 | 0.122 |
| 2996.0 | 0.12 |
| 2997.0 | 0.139 |
| 2998.0 | 0.118 |
| 2999.0 | 0.125 |
| 3000.0 | 0.136 |
| 3001.0 | 0.13 |
| 3002.0 | 0.141 |
| 3003.0 | 0.141 |
| 3004.0 | 0.114 |
| 3005.0 | 0.125 |
| 3006.0 | 0.125 |
| 3007.0 | 0.135 |
| 3008.0 | 0.124 |
| 3009.0 | 0.139 |
| 3010.0 | 0.133 |
| 3011.0 | 0.136 |
| 3012.0 | 0.131 |
| 3013.0 | 0.129 |
| 3014.0 | 0.119 |
| 3015.0 | 0.133 |
| 3016.0 | 0.142 |
| 3017.0 | 0.15 |
| 3018.0 | 0.134 |
| 3019.0 | 0.133 |
| 3020.0 | 0.129 |
| 3021.0 | 0.13 |
| 3022.0 | 0.152 |
| 3023.0 | 0.12 |
| 3024.0 | 0.137 |
| 3025.0 | 0.157 |
| 3026.0 | 0.134 |
| 3027.0 | 0.134 |
| 3028.0 | 0.141 |
| 3029.0 | 0.132 |
| 3030.0 | 0.147 |
| 3031.0 | 0.144 |
| 3032.0 | 0.156 |
| 3033.0 | 0.143 |
| 3034.0 | 0.162 |
| 3035.0 | 0.148 |
| 3036.0 | 0.143 |
| 3037.0 | 0.159 |
| 3038.0 | 0.174 |
| 3039.0 | 0.148 |
| 3040.0 | 0.154 |
| 3041.0 | 0.163 |
| 3042.0 | 0.16 |
| 3043.0 | 0.15 |
| 3044.0 | 0.146 |
| 3045.0 | 0.163 |
| 3046.0 | 0.163 |
| 3047.0 | 0.145 |
| 3048.0 | 0.165 |
| 3049.0 | 0.164 |
| 3050.0 | 0.19 |
| 3051.0 | 0.155 |
| 3052.0 | 0.147 |
| 3053.0 | 0.184 |
| 3054.0 | 0.197 |
| 3055.0 | 0.176 |
| 3056.0 | 0.174 |
| 3057.0 | 0.199 |
| 3058.0 | 0.205 |
| 3059.0 | 0.156 |
| 3060.0 | 0.171 |
| 3061.0 | 0.201 |
| 3062.0 | 0.202 |
| 3063.0 | 0.172 |
| 3064.0 | 0.192 |
| 3065.0 | 0.208 |
| 3066.0 | 0.194 |
| 3067.0 | 0.187 |
| 3068.0 | 0.228 |
| 3069.0 | 0.201 |
| 3070.0 | 0.217 |
| 3071.0 | 0.192 |
| 3072.0 | 0.211 |
| 3073.0 | 0.19 |
| 3074.0 | 0.172 |
| 3075.0 | 0.175 |
| 3076.0 | 0.186 |
| 3077.0 | 0.206 |
| 3078.0 | 0.208 |
| 3079.0 | 0.17 |
| 3080.0 | 0.184 |
| 3081.0 | 0.172 |
| 3082.0 | 0.214 |
| 3083.0 | 0.217 |
| 3084.0 | 0.2 |
| 3085.0 | 0.193 |
| 3086.0 | 0.24 |
| 3087.0 | 0.258 |
| 3088.0 | 0.233 |
| 3089.0 | 0.232 |
| 3090.0 | 0.226 |
| 3091.0 | 0.235 |
| 3092.0 | 0.236 |
| 3093.0 | 0.212 |
| 3094.0 | 0.207 |
| 3095.0 | 0.207 |
| 3096.0 | 0.298 |
| 3097.0 | 0.272 |
| 3098.0 | 0.259 |
| 3099.0 | 0.25 |
| 3100.0 | 0.223 |
| 3101.0 | 0.25 |
| 3102.0 | 0.225 |
| 3103.0 | 0.253 |
| 3104.0 | 0.305 |
| 3105.0 | 0.238 |
| 3106.0 | 0.237 |
| 3107.0 | 0.25 |
| 3108.0 | 0.315 |
| 3109.0 | 0.243 |
| 3110.0 | 0.239 |
| 3111.0 | 0.332 |
| 3112.0 | 0.291 |
| 3113.0 | 0.306 |
| 3114.0 | 0.275 |
| 3115.0 | 0.294 |
| 3116.0 | 0.295 |
| 3117.0 | 0.336 |
| 3118.0 | 0.346 |
| 3119.0 | 0.293 |
| 3120.0 | 0.328 |
| 3121.0 | 0.306 |
| 3122.0 | 0.289 |
| 3123.0 | 0.299 |
| 3124.0 | 0.33 |
| 3125.0 | 0.361 |
| 3126.0 | 0.409 |
| 3127.0 | 0.299 |
| 3128.0 | 0.392 |
| 3129.0 | 0.389 |
| 3130.0 | 0.287 |
| 3131.0 | 0.322 |
| 3132.0 | 0.37 |
| 3133.0 | 0.384 |
| 3134.0 | 0.332 |
| 3135.0 | 0.32 |
| 3136.0 | 0.349 |
| 3137.0 | 0.415 |
| 3138.0 | 0.353 |
| 3139.0 | 0.361 |
| 3140.0 | 0.369 |
| 3141.0 | 0.273 |
| 3142.0 | 0.334 |
| 3143.0 | 0.37 |
| 3144.0 | 0.397 |
| 3145.0 | 0.385 |
| 3146.0 | 0.449 |
| 3147.0 | 0.336 |
| 3148.0 | 0.35 |
| 3149.0 | 0.415 |
| 3150.0 | 0.375 |
| 3151.0 | 0.367 |
| 3152.0 | 0.408 |
| 3153.0 | 0.373 |
| 3154.0 | 0.432 |
| 3155.0 | 0.479 |
| 3156.0 | 0.421 |
| 3157.0 | 0.403 |
| 3158.0 | 0.463 |
| 3159.0 | 0.453 |
| 3160.0 | 0.434 |
| 3161.0 | 0.411 |
| 3162.0 | 0.563 |
| 3163.0 | 0.406 |
| 3164.0 | 0.535 |
| 3165.0 | 0.529 |
| 3166.0 | 0.576 |
| 3167.0 | 0.549 |
| 3168.0 | 0.569 |
| 3169.0 | 0.526 |
| 3170.0 | 0.513 |
| 3171.0 | 0.521 |
| 3172.0 | 0.444 |
| 3173.0 | 0.572 |
| 3174.0 | 0.495 |
| 3175.0 | 0.467 |
| 3176.0 | 0.466 |
| 3177.0 | 0.599 |
| 3178.0 | 0.537 |
| 3179.0 | 0.608 |
| 3180.0 | 0.492 |
| 3181.0 | 0.534 |
| 3182.0 | 0.603 |
| 3183.0 | 0.497 |
| 3184.0 | 0.619 |
| 3185.0 | 0.709 |
| 3186.0 | 0.633 |
| 3187.0 | 0.69 |
| 3188.0 | 0.794 |
| 3189.0 | 0.668 |
| 3190.0 | 0.681 |
| 3191.0 | 0.653 |
| 3192.0 | 0.679 |
| 3193.0 | 0.64 |
| 3194.0 | 0.691 |
| 3195.0 | 0.633 |
| 3196.0 | 0.664 |
| 3197.0 | 0.872 |
| 3198.0 | 0.826 |
| 3199.0 | 0.676 |
| 3200.0 | 0.688 |
| 3201.0 | 0.604 |
| 3202.0 | 0.675 |
| 3203.0 | 0.879 |
| 3204.0 | 0.809 |
| 3205.0 | 0.711 |
| 3206.0 | 0.867 |
| 3207.0 | 0.779 |
| 3208.0 | 0.912 |
| 3209.0 | 0.711 |
| 3210.0 | 0.973 |
| 3211.0 | 0.84 |
| 3212.0 | 1.039 |
| 3213.0 | 0.844 |
| 3214.0 | 0.879 |
| 3215.0 | 0.776 |
| 3216.0 | 0.929 |
| 3217.0 | 0.797 |
| 3218.0 | 0.802 |
| 3219.0 | 0.947 |
| 3220.0 | 0.875 |
| 3221.0 | 0.909 |
| 3222.0 | 0.938 |
| 3223.0 | 1.009 |
| 3224.0 | 1.059 |
| 3225.0 | 1.034 |
| 3226.0 | 1.034 |
| 3227.0 | 1.066 |
| 3228.0 | 0.91 |
| 3229.0 | 0.993 |
| 3230.0 | 0.974 |
| 3231.0 | 0.963 |
| 3232.0 | 0.993 |
| 3233.0 | 1.138 |
| 3234.0 | 1.082 |
| 3235.0 | 1.199 |
| 3236.0 | 0.802 |
| 3237.0 | 1.212 |
| 3238.0 | 1.126 |
| 3239.0 | 0.944 |
| 3240.0 | 1.195 |
| 3241.0 | 1.265 |
| 3242.0 | 1.323 |
| 3243.0 | 1.238 |
| 3244.0 | 1.124 |
| 3245.0 | 1.067 |
| 3246.0 | 1.287 |
| 3247.0 | 1.109 |
| 3248.0 | 1.351 |
| 3249.0 | 1.228 |
| 3250.0 | 1.25 |
| 3251.0 | 1.328 |
| 3252.0 | 1.106 |
| 3253.0 | 1.311 |
| 3254.0 | 1.386 |
| 3255.0 | 1.386 |
| 3256.0 | 1.222 |
| 3257.0 | 1.229 |
| 3258.0 | 1.309 |
| 3259.0 | 1.464 |
| 3260.0 | 1.255 |
| 3261.0 | 1.443 |
| 3262.0 | 1.377 |
| 3263.0 | 1.298 |
| 3264.0 | 1.476 |
| 3265.0 | 1.881 |
| 3266.0 | 1.626 |
| 3267.0 | 1.572 |
| 3268.0 | 1.56 |
| 3269.0 | 1.843 |
| 3270.0 | 1.751 |
| 3271.0 | 1.667 |
| 3272.0 | 1.662 |
| 3273.0 | 1.58 |
| 3274.0 | 1.954 |
| 3275.0 | 1.729 |
| 3276.0 | 1.773 |
| 3277.0 | 1.75 |
| 3278.0 | 1.663 |
| 3279.0 | 1.934 |
| 3280.0 | 1.655 |
| 3281.0 | 1.98 |
| 3282.0 | 1.726 |
| 3283.0 | 1.839 |
| 3284.0 | 1.728 |
| 3285.0 | 2.092 |
| 3286.0 | 2.31 |
| 3287.0 | 1.751 |
| 3288.0 | 1.867 |
| 3289.0 | 1.962 |
| 3290.0 | 1.902 |
| 3291.0 | 1.702 |
| 3292.0 | 1.711 |
| 3293.0 | 1.667 |
| 3294.0 | 2.044 |
| 3295.0 | 1.967 |
| 3296.0 | 1.888 |
| 3297.0 | 1.999 |
| 3298.0 | 2.207 |
| 3299.0 | 2.31 |
| 3300.0 | 2.218 |